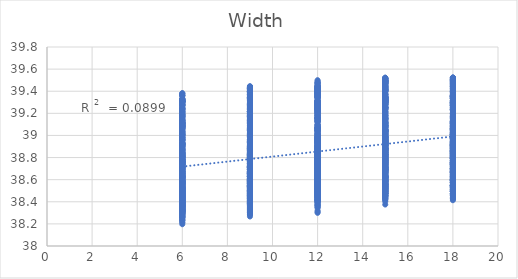
| Category | out:UTCI |
|---|---|
| 6.0 | 38.668 |
| 9.0 | 38.741 |
| 12.0 | 38.758 |
| 15.0 | 38.744 |
| 18.0 | 38.714 |
| 6.0 | 38.517 |
| 9.0 | 38.595 |
| 12.0 | 38.642 |
| 15.0 | 38.679 |
| 18.0 | 38.672 |
| 6.0 | 38.457 |
| 9.0 | 38.521 |
| 12.0 | 38.559 |
| 15.0 | 38.588 |
| 18.0 | 38.606 |
| 6.0 | 38.426 |
| 9.0 | 38.489 |
| 12.0 | 38.495 |
| 15.0 | 38.526 |
| 18.0 | 38.543 |
| 6.0 | 38.423 |
| 9.0 | 38.454 |
| 12.0 | 38.47 |
| 15.0 | 38.474 |
| 18.0 | 38.492 |
| 6.0 | 38.417 |
| 9.0 | 38.42 |
| 12.0 | 38.46 |
| 15.0 | 38.458 |
| 18.0 | 38.452 |
| 6.0 | 38.414 |
| 9.0 | 38.429 |
| 12.0 | 38.432 |
| 15.0 | 38.448 |
| 18.0 | 38.426 |
| 6.0 | 38.403 |
| 9.0 | 38.423 |
| 12.0 | 38.41 |
| 15.0 | 38.426 |
| 18.0 | 38.414 |
| 6.0 | 38.693 |
| 9.0 | 38.779 |
| 12.0 | 38.826 |
| 15.0 | 38.826 |
| 18.0 | 38.8 |
| 6.0 | 38.522 |
| 9.0 | 38.629 |
| 12.0 | 38.708 |
| 15.0 | 38.76 |
| 18.0 | 38.75 |
| 6.0 | 38.432 |
| 9.0 | 38.535 |
| 12.0 | 38.614 |
| 15.0 | 38.657 |
| 18.0 | 38.685 |
| 6.0 | 38.386 |
| 9.0 | 38.482 |
| 12.0 | 38.531 |
| 15.0 | 38.588 |
| 18.0 | 38.615 |
| 6.0 | 38.378 |
| 9.0 | 38.439 |
| 12.0 | 38.492 |
| 15.0 | 38.522 |
| 18.0 | 38.553 |
| 6.0 | 38.37 |
| 9.0 | 38.397 |
| 12.0 | 38.476 |
| 15.0 | 38.494 |
| 18.0 | 38.504 |
| 6.0 | 38.364 |
| 9.0 | 38.402 |
| 12.0 | 38.442 |
| 15.0 | 38.48 |
| 18.0 | 38.47 |
| 6.0 | 38.352 |
| 9.0 | 38.397 |
| 12.0 | 38.416 |
| 15.0 | 38.455 |
| 18.0 | 38.456 |
| 6.0 | 38.703 |
| 9.0 | 38.82 |
| 12.0 | 38.854 |
| 15.0 | 38.875 |
| 18.0 | 38.856 |
| 6.0 | 38.522 |
| 9.0 | 38.662 |
| 12.0 | 38.729 |
| 15.0 | 38.799 |
| 18.0 | 38.802 |
| 6.0 | 38.418 |
| 9.0 | 38.557 |
| 12.0 | 38.63 |
| 15.0 | 38.697 |
| 18.0 | 38.734 |
| 6.0 | 38.355 |
| 9.0 | 38.493 |
| 12.0 | 38.54 |
| 15.0 | 38.623 |
| 18.0 | 38.661 |
| 6.0 | 38.34 |
| 9.0 | 38.436 |
| 12.0 | 38.489 |
| 15.0 | 38.549 |
| 18.0 | 38.593 |
| 6.0 | 38.33 |
| 9.0 | 38.388 |
| 12.0 | 38.463 |
| 15.0 | 38.512 |
| 18.0 | 38.534 |
| 6.0 | 38.324 |
| 9.0 | 38.389 |
| 12.0 | 38.424 |
| 15.0 | 38.49 |
| 18.0 | 38.494 |
| 6.0 | 38.31 |
| 9.0 | 38.383 |
| 12.0 | 38.394 |
| 15.0 | 38.462 |
| 18.0 | 38.472 |
| 6.0 | 38.712 |
| 9.0 | 38.824 |
| 12.0 | 38.878 |
| 15.0 | 38.886 |
| 18.0 | 38.88 |
| 6.0 | 38.524 |
| 9.0 | 38.658 |
| 12.0 | 38.749 |
| 15.0 | 38.808 |
| 18.0 | 38.826 |
| 6.0 | 38.414 |
| 9.0 | 38.547 |
| 12.0 | 38.644 |
| 15.0 | 38.704 |
| 18.0 | 38.756 |
| 6.0 | 38.343 |
| 9.0 | 38.474 |
| 12.0 | 38.547 |
| 15.0 | 38.622 |
| 18.0 | 38.68 |
| 6.0 | 38.319 |
| 9.0 | 38.407 |
| 12.0 | 38.491 |
| 15.0 | 38.544 |
| 18.0 | 38.609 |
| 6.0 | 38.305 |
| 9.0 | 38.348 |
| 12.0 | 38.458 |
| 15.0 | 38.501 |
| 18.0 | 38.547 |
| 6.0 | 38.297 |
| 9.0 | 38.344 |
| 12.0 | 38.413 |
| 15.0 | 38.473 |
| 18.0 | 38.499 |
| 6.0 | 38.282 |
| 9.0 | 38.334 |
| 12.0 | 38.38 |
| 15.0 | 38.439 |
| 18.0 | 38.473 |
| 6.0 | 38.71 |
| 9.0 | 38.832 |
| 12.0 | 38.879 |
| 15.0 | 38.908 |
| 18.0 | 38.891 |
| 6.0 | 38.52 |
| 9.0 | 38.661 |
| 12.0 | 38.745 |
| 15.0 | 38.826 |
| 18.0 | 38.833 |
| 6.0 | 38.406 |
| 9.0 | 38.545 |
| 12.0 | 38.636 |
| 15.0 | 38.719 |
| 18.0 | 38.76 |
| 6.0 | 38.332 |
| 9.0 | 38.468 |
| 12.0 | 38.534 |
| 15.0 | 38.634 |
| 18.0 | 38.681 |
| 6.0 | 38.305 |
| 9.0 | 38.398 |
| 12.0 | 38.477 |
| 15.0 | 38.554 |
| 18.0 | 38.609 |
| 6.0 | 38.285 |
| 9.0 | 38.335 |
| 12.0 | 38.439 |
| 15.0 | 38.509 |
| 18.0 | 38.543 |
| 6.0 | 38.275 |
| 9.0 | 38.327 |
| 12.0 | 38.388 |
| 15.0 | 38.475 |
| 18.0 | 38.493 |
| 6.0 | 38.26 |
| 9.0 | 38.313 |
| 12.0 | 38.346 |
| 15.0 | 38.434 |
| 18.0 | 38.462 |
| 6.0 | 38.703 |
| 9.0 | 38.833 |
| 12.0 | 38.884 |
| 15.0 | 38.91 |
| 18.0 | 38.909 |
| 6.0 | 38.51 |
| 9.0 | 38.661 |
| 12.0 | 38.746 |
| 15.0 | 38.824 |
| 18.0 | 38.847 |
| 6.0 | 38.396 |
| 9.0 | 38.542 |
| 12.0 | 38.633 |
| 15.0 | 38.716 |
| 18.0 | 38.771 |
| 6.0 | 38.319 |
| 9.0 | 38.461 |
| 12.0 | 38.527 |
| 15.0 | 38.627 |
| 18.0 | 38.69 |
| 6.0 | 38.291 |
| 9.0 | 38.389 |
| 12.0 | 38.467 |
| 15.0 | 38.544 |
| 18.0 | 38.616 |
| 6.0 | 38.265 |
| 9.0 | 38.321 |
| 12.0 | 38.423 |
| 15.0 | 38.494 |
| 18.0 | 38.545 |
| 6.0 | 38.252 |
| 9.0 | 38.309 |
| 12.0 | 38.368 |
| 15.0 | 38.459 |
| 18.0 | 38.493 |
| 6.0 | 38.235 |
| 9.0 | 38.291 |
| 12.0 | 38.321 |
| 15.0 | 38.415 |
| 18.0 | 38.457 |
| 6.0 | 38.688 |
| 9.0 | 38.836 |
| 12.0 | 38.885 |
| 15.0 | 38.915 |
| 18.0 | 38.902 |
| 6.0 | 38.494 |
| 9.0 | 38.663 |
| 12.0 | 38.747 |
| 15.0 | 38.825 |
| 18.0 | 38.839 |
| 6.0 | 38.379 |
| 9.0 | 38.543 |
| 12.0 | 38.631 |
| 15.0 | 38.714 |
| 18.0 | 38.76 |
| 6.0 | 38.301 |
| 9.0 | 38.46 |
| 12.0 | 38.522 |
| 15.0 | 38.623 |
| 18.0 | 38.676 |
| 6.0 | 38.273 |
| 9.0 | 38.386 |
| 12.0 | 38.461 |
| 15.0 | 38.537 |
| 18.0 | 38.601 |
| 6.0 | 38.247 |
| 9.0 | 38.316 |
| 12.0 | 38.415 |
| 15.0 | 38.485 |
| 18.0 | 38.528 |
| 6.0 | 38.232 |
| 9.0 | 38.303 |
| 12.0 | 38.358 |
| 15.0 | 38.448 |
| 18.0 | 38.475 |
| 6.0 | 38.212 |
| 9.0 | 38.282 |
| 12.0 | 38.309 |
| 15.0 | 38.402 |
| 18.0 | 38.438 |
| 6.0 | 38.678 |
| 9.0 | 38.832 |
| 12.0 | 38.888 |
| 15.0 | 38.904 |
| 18.0 | 38.906 |
| 6.0 | 38.483 |
| 9.0 | 38.657 |
| 12.0 | 38.748 |
| 15.0 | 38.812 |
| 18.0 | 38.839 |
| 6.0 | 38.368 |
| 9.0 | 38.535 |
| 12.0 | 38.632 |
| 15.0 | 38.699 |
| 18.0 | 38.759 |
| 6.0 | 38.288 |
| 9.0 | 38.452 |
| 12.0 | 38.521 |
| 15.0 | 38.606 |
| 18.0 | 38.672 |
| 6.0 | 38.26 |
| 9.0 | 38.375 |
| 12.0 | 38.456 |
| 15.0 | 38.518 |
| 18.0 | 38.596 |
| 6.0 | 38.234 |
| 9.0 | 38.302 |
| 12.0 | 38.407 |
| 15.0 | 38.46 |
| 18.0 | 38.518 |
| 6.0 | 38.218 |
| 9.0 | 38.288 |
| 12.0 | 38.349 |
| 15.0 | 38.422 |
| 18.0 | 38.464 |
| 6.0 | 38.197 |
| 9.0 | 38.267 |
| 12.0 | 38.3 |
| 15.0 | 38.375 |
| 18.0 | 38.426 |
| 6.0 | 38.717 |
| 9.0 | 38.761 |
| 12.0 | 38.802 |
| 15.0 | 38.76 |
| 18.0 | 38.723 |
| 6.0 | 38.567 |
| 9.0 | 38.643 |
| 12.0 | 38.711 |
| 15.0 | 38.699 |
| 18.0 | 38.701 |
| 6.0 | 38.508 |
| 9.0 | 38.539 |
| 12.0 | 38.602 |
| 15.0 | 38.629 |
| 18.0 | 38.636 |
| 6.0 | 38.472 |
| 9.0 | 38.507 |
| 12.0 | 38.535 |
| 15.0 | 38.542 |
| 18.0 | 38.569 |
| 6.0 | 38.459 |
| 9.0 | 38.454 |
| 12.0 | 38.507 |
| 15.0 | 38.491 |
| 18.0 | 38.509 |
| 6.0 | 38.466 |
| 9.0 | 38.451 |
| 12.0 | 38.5 |
| 15.0 | 38.473 |
| 18.0 | 38.465 |
| 6.0 | 38.441 |
| 9.0 | 38.454 |
| 12.0 | 38.455 |
| 15.0 | 38.449 |
| 18.0 | 38.442 |
| 6.0 | 38.436 |
| 9.0 | 38.425 |
| 12.0 | 38.438 |
| 15.0 | 38.433 |
| 18.0 | 38.428 |
| 6.0 | 38.762 |
| 9.0 | 38.84 |
| 12.0 | 38.893 |
| 15.0 | 38.85 |
| 18.0 | 38.832 |
| 6.0 | 38.593 |
| 9.0 | 38.72 |
| 12.0 | 38.795 |
| 15.0 | 38.794 |
| 18.0 | 38.81 |
| 6.0 | 38.508 |
| 9.0 | 38.601 |
| 12.0 | 38.677 |
| 15.0 | 38.714 |
| 18.0 | 38.737 |
| 6.0 | 38.453 |
| 9.0 | 38.546 |
| 12.0 | 38.594 |
| 15.0 | 38.622 |
| 18.0 | 38.669 |
| 6.0 | 38.435 |
| 9.0 | 38.482 |
| 12.0 | 38.551 |
| 15.0 | 38.557 |
| 18.0 | 38.6 |
| 6.0 | 38.441 |
| 9.0 | 38.47 |
| 12.0 | 38.537 |
| 15.0 | 38.527 |
| 18.0 | 38.546 |
| 6.0 | 38.41 |
| 9.0 | 38.471 |
| 12.0 | 38.486 |
| 15.0 | 38.498 |
| 18.0 | 38.513 |
| 6.0 | 38.402 |
| 9.0 | 38.442 |
| 12.0 | 38.466 |
| 15.0 | 38.478 |
| 18.0 | 38.496 |
| 6.0 | 38.778 |
| 9.0 | 38.869 |
| 12.0 | 38.908 |
| 15.0 | 38.92 |
| 18.0 | 38.88 |
| 6.0 | 38.597 |
| 9.0 | 38.741 |
| 12.0 | 38.808 |
| 15.0 | 38.862 |
| 18.0 | 38.849 |
| 6.0 | 38.496 |
| 9.0 | 38.61 |
| 12.0 | 38.69 |
| 15.0 | 38.768 |
| 18.0 | 38.776 |
| 6.0 | 38.426 |
| 9.0 | 38.546 |
| 12.0 | 38.6 |
| 15.0 | 38.673 |
| 18.0 | 38.704 |
| 6.0 | 38.398 |
| 9.0 | 38.47 |
| 12.0 | 38.546 |
| 15.0 | 38.602 |
| 18.0 | 38.631 |
| 6.0 | 38.4 |
| 9.0 | 38.452 |
| 12.0 | 38.522 |
| 15.0 | 38.562 |
| 18.0 | 38.57 |
| 6.0 | 38.372 |
| 9.0 | 38.448 |
| 12.0 | 38.465 |
| 15.0 | 38.525 |
| 18.0 | 38.531 |
| 6.0 | 38.362 |
| 9.0 | 38.418 |
| 12.0 | 38.441 |
| 15.0 | 38.503 |
| 18.0 | 38.508 |
| 6.0 | 38.774 |
| 9.0 | 38.881 |
| 12.0 | 38.947 |
| 15.0 | 38.917 |
| 18.0 | 38.921 |
| 6.0 | 38.585 |
| 9.0 | 38.745 |
| 12.0 | 38.841 |
| 15.0 | 38.854 |
| 18.0 | 38.891 |
| 6.0 | 38.477 |
| 9.0 | 38.608 |
| 12.0 | 38.717 |
| 15.0 | 38.763 |
| 18.0 | 38.815 |
| 6.0 | 38.412 |
| 9.0 | 38.543 |
| 12.0 | 38.62 |
| 15.0 | 38.667 |
| 18.0 | 38.741 |
| 6.0 | 38.375 |
| 9.0 | 38.46 |
| 12.0 | 38.563 |
| 15.0 | 38.592 |
| 18.0 | 38.666 |
| 6.0 | 38.373 |
| 9.0 | 38.433 |
| 12.0 | 38.532 |
| 15.0 | 38.548 |
| 18.0 | 38.602 |
| 6.0 | 38.348 |
| 9.0 | 38.425 |
| 12.0 | 38.469 |
| 15.0 | 38.504 |
| 18.0 | 38.556 |
| 6.0 | 38.335 |
| 9.0 | 38.391 |
| 12.0 | 38.44 |
| 15.0 | 38.478 |
| 18.0 | 38.529 |
| 6.0 | 38.764 |
| 9.0 | 38.86 |
| 12.0 | 38.954 |
| 15.0 | 38.945 |
| 18.0 | 38.925 |
| 6.0 | 38.572 |
| 9.0 | 38.722 |
| 12.0 | 38.844 |
| 15.0 | 38.878 |
| 18.0 | 38.892 |
| 6.0 | 38.461 |
| 9.0 | 38.579 |
| 12.0 | 38.716 |
| 15.0 | 38.783 |
| 18.0 | 38.812 |
| 6.0 | 38.393 |
| 9.0 | 38.509 |
| 12.0 | 38.615 |
| 15.0 | 38.684 |
| 18.0 | 38.737 |
| 6.0 | 38.358 |
| 9.0 | 38.433 |
| 12.0 | 38.555 |
| 15.0 | 38.607 |
| 18.0 | 38.661 |
| 6.0 | 38.349 |
| 9.0 | 38.4 |
| 12.0 | 38.519 |
| 15.0 | 38.561 |
| 18.0 | 38.595 |
| 6.0 | 38.324 |
| 9.0 | 38.389 |
| 12.0 | 38.453 |
| 15.0 | 38.514 |
| 18.0 | 38.546 |
| 6.0 | 38.31 |
| 9.0 | 38.352 |
| 12.0 | 38.416 |
| 15.0 | 38.48 |
| 18.0 | 38.515 |
| 6.0 | 38.776 |
| 9.0 | 38.889 |
| 12.0 | 38.964 |
| 15.0 | 38.959 |
| 18.0 | 38.943 |
| 6.0 | 38.584 |
| 9.0 | 38.746 |
| 12.0 | 38.852 |
| 15.0 | 38.889 |
| 18.0 | 38.906 |
| 6.0 | 38.47 |
| 9.0 | 38.601 |
| 12.0 | 38.719 |
| 15.0 | 38.792 |
| 18.0 | 38.823 |
| 6.0 | 38.4 |
| 9.0 | 38.526 |
| 12.0 | 38.614 |
| 15.0 | 38.69 |
| 18.0 | 38.746 |
| 6.0 | 38.362 |
| 9.0 | 38.445 |
| 12.0 | 38.552 |
| 15.0 | 38.61 |
| 18.0 | 38.668 |
| 6.0 | 38.339 |
| 9.0 | 38.392 |
| 12.0 | 38.506 |
| 15.0 | 38.559 |
| 18.0 | 38.593 |
| 6.0 | 38.31 |
| 9.0 | 38.378 |
| 12.0 | 38.435 |
| 15.0 | 38.51 |
| 18.0 | 38.543 |
| 6.0 | 38.294 |
| 9.0 | 38.339 |
| 12.0 | 38.394 |
| 15.0 | 38.473 |
| 18.0 | 38.507 |
| 6.0 | 38.763 |
| 9.0 | 38.894 |
| 12.0 | 38.944 |
| 15.0 | 38.952 |
| 18.0 | 38.955 |
| 6.0 | 38.566 |
| 9.0 | 38.75 |
| 12.0 | 38.829 |
| 15.0 | 38.879 |
| 18.0 | 38.918 |
| 6.0 | 38.451 |
| 9.0 | 38.603 |
| 12.0 | 38.695 |
| 15.0 | 38.778 |
| 18.0 | 38.832 |
| 6.0 | 38.379 |
| 9.0 | 38.526 |
| 12.0 | 38.588 |
| 15.0 | 38.674 |
| 18.0 | 38.752 |
| 6.0 | 38.339 |
| 9.0 | 38.442 |
| 12.0 | 38.525 |
| 15.0 | 38.591 |
| 18.0 | 38.672 |
| 6.0 | 38.314 |
| 9.0 | 38.388 |
| 12.0 | 38.476 |
| 15.0 | 38.538 |
| 18.0 | 38.596 |
| 6.0 | 38.292 |
| 9.0 | 38.373 |
| 12.0 | 38.415 |
| 15.0 | 38.491 |
| 18.0 | 38.548 |
| 6.0 | 38.274 |
| 9.0 | 38.334 |
| 12.0 | 38.371 |
| 15.0 | 38.454 |
| 18.0 | 38.51 |
| 6.0 | 38.741 |
| 9.0 | 38.87 |
| 12.0 | 38.954 |
| 15.0 | 38.95 |
| 18.0 | 38.959 |
| 6.0 | 38.541 |
| 9.0 | 38.726 |
| 12.0 | 38.839 |
| 15.0 | 38.874 |
| 18.0 | 38.92 |
| 6.0 | 38.429 |
| 9.0 | 38.579 |
| 12.0 | 38.703 |
| 15.0 | 38.773 |
| 18.0 | 38.834 |
| 6.0 | 38.358 |
| 9.0 | 38.501 |
| 12.0 | 38.595 |
| 15.0 | 38.667 |
| 18.0 | 38.751 |
| 6.0 | 38.318 |
| 9.0 | 38.415 |
| 12.0 | 38.528 |
| 15.0 | 38.583 |
| 18.0 | 38.669 |
| 6.0 | 38.293 |
| 9.0 | 38.359 |
| 12.0 | 38.477 |
| 15.0 | 38.525 |
| 18.0 | 38.588 |
| 6.0 | 38.269 |
| 9.0 | 38.344 |
| 12.0 | 38.413 |
| 15.0 | 38.476 |
| 18.0 | 38.539 |
| 6.0 | 38.259 |
| 9.0 | 38.316 |
| 12.0 | 38.368 |
| 15.0 | 38.435 |
| 18.0 | 38.496 |
| 6.0 | 38.79 |
| 9.0 | 38.817 |
| 12.0 | 38.802 |
| 15.0 | 38.809 |
| 18.0 | 38.819 |
| 6.0 | 38.619 |
| 9.0 | 38.723 |
| 12.0 | 38.74 |
| 15.0 | 38.769 |
| 18.0 | 38.764 |
| 6.0 | 38.538 |
| 9.0 | 38.586 |
| 12.0 | 38.651 |
| 15.0 | 38.706 |
| 18.0 | 38.716 |
| 6.0 | 38.503 |
| 9.0 | 38.541 |
| 12.0 | 38.563 |
| 15.0 | 38.624 |
| 18.0 | 38.652 |
| 6.0 | 38.477 |
| 9.0 | 38.501 |
| 12.0 | 38.516 |
| 15.0 | 38.562 |
| 18.0 | 38.586 |
| 6.0 | 38.472 |
| 9.0 | 38.47 |
| 12.0 | 38.49 |
| 15.0 | 38.512 |
| 18.0 | 38.535 |
| 6.0 | 38.455 |
| 9.0 | 38.465 |
| 12.0 | 38.457 |
| 15.0 | 38.503 |
| 18.0 | 38.493 |
| 6.0 | 38.445 |
| 9.0 | 38.453 |
| 12.0 | 38.441 |
| 15.0 | 38.476 |
| 18.0 | 38.472 |
| 6.0 | 38.822 |
| 9.0 | 38.918 |
| 12.0 | 38.896 |
| 15.0 | 38.908 |
| 18.0 | 38.923 |
| 6.0 | 38.633 |
| 9.0 | 38.801 |
| 12.0 | 38.832 |
| 15.0 | 38.855 |
| 18.0 | 38.874 |
| 6.0 | 38.533 |
| 9.0 | 38.666 |
| 12.0 | 38.731 |
| 15.0 | 38.786 |
| 18.0 | 38.823 |
| 6.0 | 38.48 |
| 9.0 | 38.605 |
| 12.0 | 38.638 |
| 15.0 | 38.704 |
| 18.0 | 38.756 |
| 6.0 | 38.446 |
| 9.0 | 38.551 |
| 12.0 | 38.578 |
| 15.0 | 38.632 |
| 18.0 | 38.681 |
| 6.0 | 38.44 |
| 9.0 | 38.514 |
| 12.0 | 38.543 |
| 15.0 | 38.574 |
| 18.0 | 38.625 |
| 6.0 | 38.42 |
| 9.0 | 38.507 |
| 12.0 | 38.507 |
| 15.0 | 38.557 |
| 18.0 | 38.577 |
| 6.0 | 38.411 |
| 9.0 | 38.493 |
| 12.0 | 38.486 |
| 15.0 | 38.527 |
| 18.0 | 38.549 |
| 6.0 | 38.832 |
| 9.0 | 38.925 |
| 12.0 | 38.944 |
| 15.0 | 38.969 |
| 18.0 | 38.98 |
| 6.0 | 38.632 |
| 9.0 | 38.813 |
| 12.0 | 38.868 |
| 15.0 | 38.91 |
| 18.0 | 38.928 |
| 6.0 | 38.52 |
| 9.0 | 38.667 |
| 12.0 | 38.765 |
| 15.0 | 38.841 |
| 18.0 | 38.865 |
| 6.0 | 38.457 |
| 9.0 | 38.599 |
| 12.0 | 38.667 |
| 15.0 | 38.756 |
| 18.0 | 38.796 |
| 6.0 | 38.418 |
| 9.0 | 38.535 |
| 12.0 | 38.6 |
| 15.0 | 38.68 |
| 18.0 | 38.722 |
| 6.0 | 38.405 |
| 9.0 | 38.488 |
| 12.0 | 38.555 |
| 15.0 | 38.614 |
| 18.0 | 38.662 |
| 6.0 | 38.384 |
| 9.0 | 38.477 |
| 12.0 | 38.514 |
| 15.0 | 38.591 |
| 18.0 | 38.607 |
| 6.0 | 38.374 |
| 9.0 | 38.461 |
| 12.0 | 38.489 |
| 15.0 | 38.555 |
| 18.0 | 38.574 |
| 6.0 | 38.833 |
| 9.0 | 38.943 |
| 12.0 | 38.957 |
| 15.0 | 38.99 |
| 18.0 | 39.021 |
| 6.0 | 38.626 |
| 9.0 | 38.826 |
| 12.0 | 38.88 |
| 15.0 | 38.932 |
| 18.0 | 38.966 |
| 6.0 | 38.509 |
| 9.0 | 38.674 |
| 12.0 | 38.772 |
| 15.0 | 38.86 |
| 18.0 | 38.9 |
| 6.0 | 38.443 |
| 9.0 | 38.593 |
| 12.0 | 38.666 |
| 15.0 | 38.77 |
| 18.0 | 38.829 |
| 6.0 | 38.399 |
| 9.0 | 38.525 |
| 12.0 | 38.596 |
| 15.0 | 38.692 |
| 18.0 | 38.753 |
| 6.0 | 38.381 |
| 9.0 | 38.471 |
| 12.0 | 38.546 |
| 15.0 | 38.623 |
| 18.0 | 38.691 |
| 6.0 | 38.359 |
| 9.0 | 38.455 |
| 12.0 | 38.5 |
| 15.0 | 38.595 |
| 18.0 | 38.634 |
| 6.0 | 38.347 |
| 9.0 | 38.435 |
| 12.0 | 38.466 |
| 15.0 | 38.552 |
| 18.0 | 38.596 |
| 6.0 | 38.83 |
| 9.0 | 38.943 |
| 12.0 | 38.97 |
| 15.0 | 39 |
| 18.0 | 39.032 |
| 6.0 | 38.622 |
| 9.0 | 38.822 |
| 12.0 | 38.889 |
| 15.0 | 38.938 |
| 18.0 | 38.971 |
| 6.0 | 38.5 |
| 9.0 | 38.666 |
| 12.0 | 38.777 |
| 15.0 | 38.864 |
| 18.0 | 38.907 |
| 6.0 | 38.43 |
| 9.0 | 38.581 |
| 12.0 | 38.668 |
| 15.0 | 38.771 |
| 18.0 | 38.834 |
| 6.0 | 38.386 |
| 9.0 | 38.507 |
| 12.0 | 38.596 |
| 15.0 | 38.69 |
| 18.0 | 38.761 |
| 6.0 | 38.364 |
| 9.0 | 38.45 |
| 12.0 | 38.544 |
| 15.0 | 38.619 |
| 18.0 | 38.696 |
| 6.0 | 38.343 |
| 9.0 | 38.43 |
| 12.0 | 38.496 |
| 15.0 | 38.588 |
| 18.0 | 38.637 |
| 6.0 | 38.329 |
| 9.0 | 38.406 |
| 12.0 | 38.457 |
| 15.0 | 38.541 |
| 18.0 | 38.595 |
| 6.0 | 38.839 |
| 9.0 | 38.94 |
| 12.0 | 38.98 |
| 15.0 | 39.012 |
| 18.0 | 39.033 |
| 6.0 | 38.628 |
| 9.0 | 38.815 |
| 12.0 | 38.899 |
| 15.0 | 38.947 |
| 18.0 | 38.974 |
| 6.0 | 38.505 |
| 9.0 | 38.654 |
| 12.0 | 38.782 |
| 15.0 | 38.869 |
| 18.0 | 38.907 |
| 6.0 | 38.435 |
| 9.0 | 38.566 |
| 12.0 | 38.668 |
| 15.0 | 38.774 |
| 18.0 | 38.832 |
| 6.0 | 38.389 |
| 9.0 | 38.49 |
| 12.0 | 38.594 |
| 15.0 | 38.691 |
| 18.0 | 38.757 |
| 6.0 | 38.361 |
| 9.0 | 38.434 |
| 12.0 | 38.543 |
| 15.0 | 38.615 |
| 18.0 | 38.687 |
| 6.0 | 38.336 |
| 9.0 | 38.413 |
| 12.0 | 38.494 |
| 15.0 | 38.582 |
| 18.0 | 38.626 |
| 6.0 | 38.322 |
| 9.0 | 38.386 |
| 12.0 | 38.452 |
| 15.0 | 38.533 |
| 18.0 | 38.583 |
| 6.0 | 38.833 |
| 9.0 | 38.948 |
| 12.0 | 38.979 |
| 15.0 | 39.032 |
| 18.0 | 39.057 |
| 6.0 | 38.621 |
| 9.0 | 38.822 |
| 12.0 | 38.895 |
| 15.0 | 38.966 |
| 18.0 | 38.994 |
| 6.0 | 38.496 |
| 9.0 | 38.66 |
| 12.0 | 38.777 |
| 15.0 | 38.884 |
| 18.0 | 38.926 |
| 6.0 | 38.425 |
| 9.0 | 38.57 |
| 12.0 | 38.662 |
| 15.0 | 38.787 |
| 18.0 | 38.849 |
| 6.0 | 38.379 |
| 9.0 | 38.492 |
| 12.0 | 38.586 |
| 15.0 | 38.701 |
| 18.0 | 38.771 |
| 6.0 | 38.351 |
| 9.0 | 38.434 |
| 12.0 | 38.532 |
| 15.0 | 38.623 |
| 18.0 | 38.7 |
| 6.0 | 38.326 |
| 9.0 | 38.412 |
| 12.0 | 38.482 |
| 15.0 | 38.589 |
| 18.0 | 38.635 |
| 6.0 | 38.311 |
| 9.0 | 38.384 |
| 12.0 | 38.439 |
| 15.0 | 38.54 |
| 18.0 | 38.59 |
| 6.0 | 38.837 |
| 9.0 | 38.948 |
| 12.0 | 38.981 |
| 15.0 | 39.031 |
| 18.0 | 39.053 |
| 6.0 | 38.628 |
| 9.0 | 38.822 |
| 12.0 | 38.897 |
| 15.0 | 38.963 |
| 18.0 | 38.99 |
| 6.0 | 38.499 |
| 9.0 | 38.659 |
| 12.0 | 38.776 |
| 15.0 | 38.88 |
| 18.0 | 38.92 |
| 6.0 | 38.426 |
| 9.0 | 38.566 |
| 12.0 | 38.658 |
| 15.0 | 38.781 |
| 18.0 | 38.843 |
| 6.0 | 38.38 |
| 9.0 | 38.486 |
| 12.0 | 38.578 |
| 15.0 | 38.69 |
| 18.0 | 38.76 |
| 6.0 | 38.351 |
| 9.0 | 38.427 |
| 12.0 | 38.523 |
| 15.0 | 38.61 |
| 18.0 | 38.688 |
| 6.0 | 38.325 |
| 9.0 | 38.404 |
| 12.0 | 38.471 |
| 15.0 | 38.576 |
| 18.0 | 38.622 |
| 6.0 | 38.305 |
| 9.0 | 38.369 |
| 12.0 | 38.417 |
| 15.0 | 38.526 |
| 18.0 | 38.58 |
| 6.0 | 38.891 |
| 9.0 | 38.894 |
| 12.0 | 38.962 |
| 15.0 | 38.928 |
| 18.0 | 38.893 |
| 6.0 | 38.713 |
| 9.0 | 38.833 |
| 12.0 | 38.901 |
| 15.0 | 38.871 |
| 18.0 | 38.873 |
| 6.0 | 38.625 |
| 9.0 | 38.708 |
| 12.0 | 38.813 |
| 15.0 | 38.824 |
| 18.0 | 38.81 |
| 6.0 | 38.565 |
| 9.0 | 38.628 |
| 12.0 | 38.734 |
| 15.0 | 38.752 |
| 18.0 | 38.771 |
| 6.0 | 38.521 |
| 9.0 | 38.578 |
| 12.0 | 38.653 |
| 15.0 | 38.689 |
| 18.0 | 38.724 |
| 6.0 | 38.518 |
| 9.0 | 38.534 |
| 12.0 | 38.615 |
| 15.0 | 38.633 |
| 18.0 | 38.649 |
| 6.0 | 38.51 |
| 9.0 | 38.523 |
| 12.0 | 38.578 |
| 15.0 | 38.575 |
| 18.0 | 38.601 |
| 6.0 | 38.479 |
| 9.0 | 38.5 |
| 12.0 | 38.528 |
| 15.0 | 38.567 |
| 18.0 | 38.561 |
| 6.0 | 38.921 |
| 9.0 | 39.003 |
| 12.0 | 39.055 |
| 15.0 | 39.036 |
| 18.0 | 39.028 |
| 6.0 | 38.734 |
| 9.0 | 38.923 |
| 12.0 | 38.988 |
| 15.0 | 38.979 |
| 18.0 | 38.99 |
| 6.0 | 38.634 |
| 9.0 | 38.791 |
| 12.0 | 38.892 |
| 15.0 | 38.931 |
| 18.0 | 38.925 |
| 6.0 | 38.556 |
| 9.0 | 38.706 |
| 12.0 | 38.81 |
| 15.0 | 38.856 |
| 18.0 | 38.884 |
| 6.0 | 38.507 |
| 9.0 | 38.644 |
| 12.0 | 38.725 |
| 15.0 | 38.788 |
| 18.0 | 38.832 |
| 6.0 | 38.5 |
| 9.0 | 38.593 |
| 12.0 | 38.68 |
| 15.0 | 38.726 |
| 18.0 | 38.757 |
| 6.0 | 38.487 |
| 9.0 | 38.577 |
| 12.0 | 38.635 |
| 15.0 | 38.662 |
| 18.0 | 38.704 |
| 6.0 | 38.453 |
| 9.0 | 38.553 |
| 12.0 | 38.584 |
| 15.0 | 38.647 |
| 18.0 | 38.659 |
| 6.0 | 38.963 |
| 9.0 | 39.019 |
| 12.0 | 39.096 |
| 15.0 | 39.098 |
| 18.0 | 39.072 |
| 6.0 | 38.767 |
| 9.0 | 38.932 |
| 12.0 | 39.019 |
| 15.0 | 39.036 |
| 18.0 | 39.031 |
| 6.0 | 38.655 |
| 9.0 | 38.798 |
| 12.0 | 38.922 |
| 15.0 | 38.989 |
| 18.0 | 38.978 |
| 6.0 | 38.563 |
| 9.0 | 38.708 |
| 12.0 | 38.836 |
| 15.0 | 38.909 |
| 18.0 | 38.934 |
| 6.0 | 38.51 |
| 9.0 | 38.641 |
| 12.0 | 38.748 |
| 15.0 | 38.836 |
| 18.0 | 38.882 |
| 6.0 | 38.499 |
| 9.0 | 38.58 |
| 12.0 | 38.699 |
| 15.0 | 38.775 |
| 18.0 | 38.807 |
| 6.0 | 38.478 |
| 9.0 | 38.561 |
| 12.0 | 38.647 |
| 15.0 | 38.708 |
| 18.0 | 38.752 |
| 6.0 | 38.447 |
| 9.0 | 38.535 |
| 12.0 | 38.593 |
| 15.0 | 38.687 |
| 18.0 | 38.702 |
| 6.0 | 38.962 |
| 9.0 | 39.047 |
| 12.0 | 39.13 |
| 15.0 | 39.127 |
| 18.0 | 39.121 |
| 6.0 | 38.76 |
| 9.0 | 38.959 |
| 12.0 | 39.049 |
| 15.0 | 39.061 |
| 18.0 | 39.077 |
| 6.0 | 38.643 |
| 9.0 | 38.821 |
| 12.0 | 38.947 |
| 15.0 | 39.011 |
| 18.0 | 39.022 |
| 6.0 | 38.542 |
| 9.0 | 38.722 |
| 12.0 | 38.857 |
| 15.0 | 38.92 |
| 18.0 | 38.976 |
| 6.0 | 38.491 |
| 9.0 | 38.653 |
| 12.0 | 38.767 |
| 15.0 | 38.848 |
| 18.0 | 38.92 |
| 6.0 | 38.473 |
| 9.0 | 38.587 |
| 12.0 | 38.716 |
| 15.0 | 38.786 |
| 18.0 | 38.845 |
| 6.0 | 38.448 |
| 9.0 | 38.562 |
| 12.0 | 38.66 |
| 15.0 | 38.717 |
| 18.0 | 38.79 |
| 6.0 | 38.42 |
| 9.0 | 38.533 |
| 12.0 | 38.603 |
| 15.0 | 38.693 |
| 18.0 | 38.736 |
| 6.0 | 38.937 |
| 9.0 | 39.056 |
| 12.0 | 39.126 |
| 15.0 | 39.156 |
| 18.0 | 39.153 |
| 6.0 | 38.733 |
| 9.0 | 38.964 |
| 12.0 | 39.047 |
| 15.0 | 39.086 |
| 18.0 | 39.107 |
| 6.0 | 38.613 |
| 9.0 | 38.822 |
| 12.0 | 38.941 |
| 15.0 | 39.034 |
| 18.0 | 39.05 |
| 6.0 | 38.509 |
| 9.0 | 38.721 |
| 12.0 | 38.848 |
| 15.0 | 38.94 |
| 18.0 | 39.003 |
| 6.0 | 38.465 |
| 9.0 | 38.644 |
| 12.0 | 38.755 |
| 15.0 | 38.867 |
| 18.0 | 38.934 |
| 6.0 | 38.443 |
| 9.0 | 38.573 |
| 12.0 | 38.705 |
| 15.0 | 38.802 |
| 18.0 | 38.858 |
| 6.0 | 38.418 |
| 9.0 | 38.548 |
| 12.0 | 38.645 |
| 15.0 | 38.733 |
| 18.0 | 38.802 |
| 6.0 | 38.388 |
| 9.0 | 38.517 |
| 12.0 | 38.59 |
| 15.0 | 38.706 |
| 18.0 | 38.747 |
| 6.0 | 38.958 |
| 9.0 | 39.056 |
| 12.0 | 39.155 |
| 15.0 | 39.159 |
| 18.0 | 39.169 |
| 6.0 | 38.756 |
| 9.0 | 38.963 |
| 12.0 | 39.072 |
| 15.0 | 39.088 |
| 18.0 | 39.121 |
| 6.0 | 38.634 |
| 9.0 | 38.818 |
| 12.0 | 38.964 |
| 15.0 | 39.032 |
| 18.0 | 39.061 |
| 6.0 | 38.527 |
| 9.0 | 38.715 |
| 12.0 | 38.87 |
| 15.0 | 38.941 |
| 18.0 | 39.011 |
| 6.0 | 38.478 |
| 9.0 | 38.635 |
| 12.0 | 38.776 |
| 15.0 | 38.865 |
| 18.0 | 38.939 |
| 6.0 | 38.444 |
| 9.0 | 38.567 |
| 12.0 | 38.716 |
| 15.0 | 38.795 |
| 18.0 | 38.865 |
| 6.0 | 38.415 |
| 9.0 | 38.536 |
| 12.0 | 38.655 |
| 15.0 | 38.725 |
| 18.0 | 38.808 |
| 6.0 | 38.384 |
| 9.0 | 38.503 |
| 12.0 | 38.597 |
| 15.0 | 38.697 |
| 18.0 | 38.751 |
| 6.0 | 38.959 |
| 9.0 | 39.064 |
| 12.0 | 39.152 |
| 15.0 | 39.167 |
| 18.0 | 39.169 |
| 6.0 | 38.752 |
| 9.0 | 38.969 |
| 12.0 | 39.068 |
| 15.0 | 39.095 |
| 18.0 | 39.12 |
| 6.0 | 38.63 |
| 9.0 | 38.822 |
| 12.0 | 38.958 |
| 15.0 | 39.038 |
| 18.0 | 39.058 |
| 6.0 | 38.525 |
| 9.0 | 38.717 |
| 12.0 | 38.861 |
| 15.0 | 38.945 |
| 18.0 | 39.007 |
| 6.0 | 38.475 |
| 9.0 | 38.635 |
| 12.0 | 38.765 |
| 15.0 | 38.869 |
| 18.0 | 38.935 |
| 6.0 | 38.444 |
| 9.0 | 38.564 |
| 12.0 | 38.703 |
| 15.0 | 38.798 |
| 18.0 | 38.86 |
| 6.0 | 38.412 |
| 9.0 | 38.528 |
| 12.0 | 38.644 |
| 15.0 | 38.724 |
| 18.0 | 38.808 |
| 6.0 | 38.38 |
| 9.0 | 38.493 |
| 12.0 | 38.586 |
| 15.0 | 38.694 |
| 18.0 | 38.75 |
| 6.0 | 38.956 |
| 9.0 | 39.045 |
| 12.0 | 39.142 |
| 15.0 | 39.182 |
| 18.0 | 39.176 |
| 6.0 | 38.748 |
| 9.0 | 38.948 |
| 12.0 | 39.055 |
| 15.0 | 39.11 |
| 18.0 | 39.125 |
| 6.0 | 38.627 |
| 9.0 | 38.8 |
| 12.0 | 38.945 |
| 15.0 | 39.052 |
| 18.0 | 39.062 |
| 6.0 | 38.521 |
| 9.0 | 38.694 |
| 12.0 | 38.85 |
| 15.0 | 38.959 |
| 18.0 | 39.009 |
| 6.0 | 38.473 |
| 9.0 | 38.61 |
| 12.0 | 38.753 |
| 15.0 | 38.882 |
| 18.0 | 38.934 |
| 6.0 | 38.439 |
| 9.0 | 38.539 |
| 12.0 | 38.692 |
| 15.0 | 38.809 |
| 18.0 | 38.858 |
| 6.0 | 38.408 |
| 9.0 | 38.501 |
| 12.0 | 38.63 |
| 15.0 | 38.735 |
| 18.0 | 38.803 |
| 6.0 | 38.386 |
| 9.0 | 38.467 |
| 12.0 | 38.582 |
| 15.0 | 38.696 |
| 18.0 | 38.739 |
| 6.0 | 39.05 |
| 9.0 | 39.087 |
| 12.0 | 39.101 |
| 15.0 | 39.045 |
| 18.0 | 38.994 |
| 6.0 | 38.886 |
| 9.0 | 39.009 |
| 12.0 | 39.091 |
| 15.0 | 39.048 |
| 18.0 | 39.019 |
| 6.0 | 38.744 |
| 9.0 | 38.904 |
| 12.0 | 39.009 |
| 15.0 | 39.019 |
| 18.0 | 39.022 |
| 6.0 | 38.655 |
| 9.0 | 38.789 |
| 12.0 | 38.932 |
| 15.0 | 38.976 |
| 18.0 | 38.992 |
| 6.0 | 38.596 |
| 9.0 | 38.71 |
| 12.0 | 38.851 |
| 15.0 | 38.918 |
| 18.0 | 38.94 |
| 6.0 | 38.57 |
| 9.0 | 38.645 |
| 12.0 | 38.764 |
| 15.0 | 38.853 |
| 18.0 | 38.884 |
| 6.0 | 38.551 |
| 9.0 | 38.584 |
| 12.0 | 38.711 |
| 15.0 | 38.788 |
| 18.0 | 38.841 |
| 6.0 | 38.527 |
| 9.0 | 38.563 |
| 12.0 | 38.664 |
| 15.0 | 38.724 |
| 18.0 | 38.796 |
| 6.0 | 39.098 |
| 9.0 | 39.161 |
| 12.0 | 39.193 |
| 15.0 | 39.147 |
| 18.0 | 39.104 |
| 6.0 | 38.923 |
| 9.0 | 39.074 |
| 12.0 | 39.177 |
| 15.0 | 39.153 |
| 18.0 | 39.127 |
| 6.0 | 38.775 |
| 9.0 | 38.96 |
| 12.0 | 39.092 |
| 15.0 | 39.12 |
| 18.0 | 39.126 |
| 6.0 | 38.677 |
| 9.0 | 38.843 |
| 12.0 | 39.009 |
| 15.0 | 39.074 |
| 18.0 | 39.095 |
| 6.0 | 38.612 |
| 9.0 | 38.764 |
| 12.0 | 38.93 |
| 15.0 | 39.014 |
| 18.0 | 39.042 |
| 6.0 | 38.579 |
| 9.0 | 38.69 |
| 12.0 | 38.842 |
| 15.0 | 38.948 |
| 18.0 | 38.985 |
| 6.0 | 38.561 |
| 9.0 | 38.628 |
| 12.0 | 38.785 |
| 15.0 | 38.883 |
| 18.0 | 38.941 |
| 6.0 | 38.534 |
| 9.0 | 38.603 |
| 12.0 | 38.735 |
| 15.0 | 38.817 |
| 18.0 | 38.896 |
| 6.0 | 39.095 |
| 9.0 | 39.215 |
| 12.0 | 39.242 |
| 15.0 | 39.21 |
| 18.0 | 39.181 |
| 6.0 | 38.916 |
| 9.0 | 39.122 |
| 12.0 | 39.221 |
| 15.0 | 39.212 |
| 18.0 | 39.202 |
| 6.0 | 38.761 |
| 9.0 | 39.002 |
| 12.0 | 39.131 |
| 15.0 | 39.176 |
| 18.0 | 39.198 |
| 6.0 | 38.658 |
| 9.0 | 38.881 |
| 12.0 | 39.049 |
| 15.0 | 39.128 |
| 18.0 | 39.165 |
| 6.0 | 38.589 |
| 9.0 | 38.8 |
| 12.0 | 38.967 |
| 15.0 | 39.066 |
| 18.0 | 39.111 |
| 6.0 | 38.553 |
| 9.0 | 38.725 |
| 12.0 | 38.881 |
| 15.0 | 39 |
| 18.0 | 39.053 |
| 6.0 | 38.53 |
| 9.0 | 38.66 |
| 12.0 | 38.821 |
| 15.0 | 38.934 |
| 18.0 | 39.008 |
| 6.0 | 38.502 |
| 9.0 | 38.629 |
| 12.0 | 38.767 |
| 15.0 | 38.865 |
| 18.0 | 38.963 |
| 6.0 | 39.108 |
| 9.0 | 39.216 |
| 12.0 | 39.274 |
| 15.0 | 39.253 |
| 18.0 | 39.23 |
| 6.0 | 38.921 |
| 9.0 | 39.114 |
| 12.0 | 39.249 |
| 15.0 | 39.254 |
| 18.0 | 39.25 |
| 6.0 | 38.761 |
| 9.0 | 38.995 |
| 12.0 | 39.157 |
| 15.0 | 39.218 |
| 18.0 | 39.243 |
| 6.0 | 38.654 |
| 9.0 | 38.884 |
| 12.0 | 39.071 |
| 15.0 | 39.156 |
| 18.0 | 39.208 |
| 6.0 | 38.58 |
| 9.0 | 38.8 |
| 12.0 | 38.987 |
| 15.0 | 39.093 |
| 18.0 | 39.152 |
| 6.0 | 38.543 |
| 9.0 | 38.723 |
| 12.0 | 38.897 |
| 15.0 | 39.021 |
| 18.0 | 39.094 |
| 6.0 | 38.516 |
| 9.0 | 38.658 |
| 12.0 | 38.838 |
| 15.0 | 38.954 |
| 18.0 | 39.047 |
| 6.0 | 38.485 |
| 9.0 | 38.624 |
| 12.0 | 38.784 |
| 15.0 | 38.888 |
| 18.0 | 39.001 |
| 6.0 | 39.113 |
| 9.0 | 39.23 |
| 12.0 | 39.283 |
| 15.0 | 39.282 |
| 18.0 | 39.255 |
| 6.0 | 38.925 |
| 9.0 | 39.126 |
| 12.0 | 39.255 |
| 15.0 | 39.281 |
| 18.0 | 39.272 |
| 6.0 | 38.761 |
| 9.0 | 39.004 |
| 12.0 | 39.16 |
| 15.0 | 39.243 |
| 18.0 | 39.263 |
| 6.0 | 38.65 |
| 9.0 | 38.889 |
| 12.0 | 39.072 |
| 15.0 | 39.175 |
| 18.0 | 39.225 |
| 6.0 | 38.569 |
| 9.0 | 38.788 |
| 12.0 | 38.986 |
| 15.0 | 39.109 |
| 18.0 | 39.171 |
| 6.0 | 38.532 |
| 9.0 | 38.709 |
| 12.0 | 38.895 |
| 15.0 | 39.04 |
| 18.0 | 39.111 |
| 6.0 | 38.504 |
| 9.0 | 38.644 |
| 12.0 | 38.836 |
| 15.0 | 38.973 |
| 18.0 | 39.063 |
| 6.0 | 38.471 |
| 9.0 | 38.608 |
| 12.0 | 38.78 |
| 15.0 | 38.906 |
| 18.0 | 39.017 |
| 6.0 | 39.111 |
| 9.0 | 39.228 |
| 12.0 | 39.291 |
| 15.0 | 39.293 |
| 18.0 | 39.273 |
| 6.0 | 38.923 |
| 9.0 | 39.127 |
| 12.0 | 39.253 |
| 15.0 | 39.291 |
| 18.0 | 39.286 |
| 6.0 | 38.756 |
| 9.0 | 39 |
| 12.0 | 39.158 |
| 15.0 | 39.25 |
| 18.0 | 39.274 |
| 6.0 | 38.641 |
| 9.0 | 38.882 |
| 12.0 | 39.067 |
| 15.0 | 39.181 |
| 18.0 | 39.234 |
| 6.0 | 38.559 |
| 9.0 | 38.779 |
| 12.0 | 38.979 |
| 15.0 | 39.114 |
| 18.0 | 39.178 |
| 6.0 | 38.521 |
| 9.0 | 38.698 |
| 12.0 | 38.902 |
| 15.0 | 39.043 |
| 18.0 | 39.125 |
| 6.0 | 38.493 |
| 9.0 | 38.631 |
| 12.0 | 38.839 |
| 15.0 | 38.975 |
| 18.0 | 39.075 |
| 6.0 | 38.459 |
| 9.0 | 38.593 |
| 12.0 | 38.782 |
| 15.0 | 38.907 |
| 18.0 | 39.028 |
| 6.0 | 39.105 |
| 9.0 | 39.217 |
| 12.0 | 39.289 |
| 15.0 | 39.304 |
| 18.0 | 39.282 |
| 6.0 | 38.916 |
| 9.0 | 39.114 |
| 12.0 | 39.255 |
| 15.0 | 39.298 |
| 18.0 | 39.298 |
| 6.0 | 38.751 |
| 9.0 | 38.991 |
| 12.0 | 39.158 |
| 15.0 | 39.255 |
| 18.0 | 39.287 |
| 6.0 | 38.636 |
| 9.0 | 38.874 |
| 12.0 | 39.067 |
| 15.0 | 39.184 |
| 18.0 | 39.247 |
| 6.0 | 38.554 |
| 9.0 | 38.771 |
| 12.0 | 38.977 |
| 15.0 | 39.116 |
| 18.0 | 39.191 |
| 6.0 | 38.515 |
| 9.0 | 38.688 |
| 12.0 | 38.901 |
| 15.0 | 39.044 |
| 18.0 | 39.137 |
| 6.0 | 38.481 |
| 9.0 | 38.63 |
| 12.0 | 38.823 |
| 15.0 | 38.983 |
| 18.0 | 39.076 |
| 6.0 | 38.447 |
| 9.0 | 38.59 |
| 12.0 | 38.766 |
| 15.0 | 38.915 |
| 18.0 | 39.023 |
| 6.0 | 39.096 |
| 9.0 | 39.232 |
| 12.0 | 39.289 |
| 15.0 | 39.302 |
| 18.0 | 39.295 |
| 6.0 | 38.904 |
| 9.0 | 39.129 |
| 12.0 | 39.255 |
| 15.0 | 39.294 |
| 18.0 | 39.31 |
| 6.0 | 38.736 |
| 9.0 | 39.004 |
| 12.0 | 39.156 |
| 15.0 | 39.25 |
| 18.0 | 39.297 |
| 6.0 | 38.62 |
| 9.0 | 38.884 |
| 12.0 | 39.065 |
| 15.0 | 39.178 |
| 18.0 | 39.256 |
| 6.0 | 38.536 |
| 9.0 | 38.78 |
| 12.0 | 38.973 |
| 15.0 | 39.107 |
| 18.0 | 39.197 |
| 6.0 | 38.496 |
| 9.0 | 38.695 |
| 12.0 | 38.897 |
| 15.0 | 39.034 |
| 18.0 | 39.143 |
| 6.0 | 38.461 |
| 9.0 | 38.635 |
| 12.0 | 38.817 |
| 15.0 | 38.971 |
| 18.0 | 39.077 |
| 6.0 | 38.427 |
| 9.0 | 38.582 |
| 12.0 | 38.759 |
| 15.0 | 38.903 |
| 18.0 | 39.023 |
| 6.0 | 39.307 |
| 9.0 | 39.181 |
| 12.0 | 39.176 |
| 15.0 | 39.073 |
| 18.0 | 38.992 |
| 6.0 | 39.27 |
| 9.0 | 39.233 |
| 12.0 | 39.244 |
| 15.0 | 39.151 |
| 18.0 | 39.098 |
| 6.0 | 39.197 |
| 9.0 | 39.211 |
| 12.0 | 39.248 |
| 15.0 | 39.198 |
| 18.0 | 39.132 |
| 6.0 | 39.109 |
| 9.0 | 39.183 |
| 12.0 | 39.242 |
| 15.0 | 39.195 |
| 18.0 | 39.162 |
| 6.0 | 38.981 |
| 9.0 | 39.108 |
| 12.0 | 39.204 |
| 15.0 | 39.191 |
| 18.0 | 39.167 |
| 6.0 | 38.887 |
| 9.0 | 39.048 |
| 12.0 | 39.178 |
| 15.0 | 39.166 |
| 18.0 | 39.151 |
| 6.0 | 38.801 |
| 9.0 | 38.992 |
| 12.0 | 39.117 |
| 15.0 | 39.127 |
| 18.0 | 39.131 |
| 6.0 | 38.742 |
| 9.0 | 38.911 |
| 12.0 | 39.089 |
| 15.0 | 39.093 |
| 18.0 | 39.113 |
| 6.0 | 39.362 |
| 9.0 | 39.321 |
| 12.0 | 39.287 |
| 15.0 | 39.23 |
| 18.0 | 39.175 |
| 6.0 | 39.314 |
| 9.0 | 39.37 |
| 12.0 | 39.349 |
| 15.0 | 39.31 |
| 18.0 | 39.271 |
| 6.0 | 39.236 |
| 9.0 | 39.342 |
| 12.0 | 39.35 |
| 15.0 | 39.351 |
| 18.0 | 39.301 |
| 6.0 | 39.143 |
| 9.0 | 39.309 |
| 12.0 | 39.342 |
| 15.0 | 39.346 |
| 18.0 | 39.33 |
| 6.0 | 39.014 |
| 9.0 | 39.237 |
| 12.0 | 39.304 |
| 15.0 | 39.343 |
| 18.0 | 39.335 |
| 6.0 | 38.929 |
| 9.0 | 39.171 |
| 12.0 | 39.277 |
| 15.0 | 39.317 |
| 18.0 | 39.317 |
| 6.0 | 38.83 |
| 9.0 | 39.117 |
| 12.0 | 39.213 |
| 15.0 | 39.276 |
| 18.0 | 39.297 |
| 6.0 | 38.765 |
| 9.0 | 39.038 |
| 12.0 | 39.188 |
| 15.0 | 39.242 |
| 18.0 | 39.279 |
| 6.0 | 39.381 |
| 9.0 | 39.36 |
| 12.0 | 39.344 |
| 15.0 | 39.318 |
| 18.0 | 39.24 |
| 6.0 | 39.328 |
| 9.0 | 39.409 |
| 12.0 | 39.403 |
| 15.0 | 39.393 |
| 18.0 | 39.333 |
| 6.0 | 39.239 |
| 9.0 | 39.374 |
| 12.0 | 39.399 |
| 15.0 | 39.429 |
| 18.0 | 39.37 |
| 6.0 | 39.134 |
| 9.0 | 39.335 |
| 12.0 | 39.388 |
| 15.0 | 39.421 |
| 18.0 | 39.397 |
| 6.0 | 39.006 |
| 9.0 | 39.259 |
| 12.0 | 39.347 |
| 15.0 | 39.414 |
| 18.0 | 39.401 |
| 6.0 | 38.928 |
| 9.0 | 39.195 |
| 12.0 | 39.32 |
| 15.0 | 39.386 |
| 18.0 | 39.382 |
| 6.0 | 38.817 |
| 9.0 | 39.14 |
| 12.0 | 39.255 |
| 15.0 | 39.344 |
| 18.0 | 39.361 |
| 6.0 | 38.763 |
| 9.0 | 39.061 |
| 12.0 | 39.229 |
| 15.0 | 39.31 |
| 18.0 | 39.343 |
| 6.0 | 39.375 |
| 9.0 | 39.393 |
| 12.0 | 39.381 |
| 15.0 | 39.357 |
| 18.0 | 39.302 |
| 6.0 | 39.326 |
| 9.0 | 39.438 |
| 12.0 | 39.437 |
| 15.0 | 39.43 |
| 18.0 | 39.394 |
| 6.0 | 39.24 |
| 9.0 | 39.401 |
| 12.0 | 39.43 |
| 15.0 | 39.464 |
| 18.0 | 39.428 |
| 6.0 | 39.134 |
| 9.0 | 39.356 |
| 12.0 | 39.415 |
| 15.0 | 39.45 |
| 18.0 | 39.453 |
| 6.0 | 39.006 |
| 9.0 | 39.281 |
| 12.0 | 39.373 |
| 15.0 | 39.441 |
| 18.0 | 39.456 |
| 6.0 | 38.925 |
| 9.0 | 39.216 |
| 12.0 | 39.344 |
| 15.0 | 39.412 |
| 18.0 | 39.436 |
| 6.0 | 38.81 |
| 9.0 | 39.159 |
| 12.0 | 39.278 |
| 15.0 | 39.369 |
| 18.0 | 39.414 |
| 6.0 | 38.76 |
| 9.0 | 39.08 |
| 12.0 | 39.25 |
| 15.0 | 39.334 |
| 18.0 | 39.396 |
| 6.0 | 39.365 |
| 9.0 | 39.387 |
| 12.0 | 39.398 |
| 15.0 | 39.402 |
| 18.0 | 39.331 |
| 6.0 | 39.31 |
| 9.0 | 39.427 |
| 12.0 | 39.454 |
| 15.0 | 39.47 |
| 18.0 | 39.423 |
| 6.0 | 39.22 |
| 9.0 | 39.385 |
| 12.0 | 39.444 |
| 15.0 | 39.503 |
| 18.0 | 39.457 |
| 6.0 | 39.113 |
| 9.0 | 39.337 |
| 12.0 | 39.428 |
| 15.0 | 39.486 |
| 18.0 | 39.48 |
| 6.0 | 39.001 |
| 9.0 | 39.264 |
| 12.0 | 39.384 |
| 15.0 | 39.475 |
| 18.0 | 39.472 |
| 6.0 | 38.916 |
| 9.0 | 39.197 |
| 12.0 | 39.354 |
| 15.0 | 39.446 |
| 18.0 | 39.45 |
| 6.0 | 38.802 |
| 9.0 | 39.138 |
| 12.0 | 39.288 |
| 15.0 | 39.401 |
| 18.0 | 39.428 |
| 6.0 | 38.749 |
| 9.0 | 39.06 |
| 12.0 | 39.259 |
| 15.0 | 39.365 |
| 18.0 | 39.409 |
| 6.0 | 39.382 |
| 9.0 | 39.394 |
| 12.0 | 39.43 |
| 15.0 | 39.411 |
| 18.0 | 39.352 |
| 6.0 | 39.324 |
| 9.0 | 39.435 |
| 12.0 | 39.485 |
| 15.0 | 39.479 |
| 18.0 | 39.442 |
| 6.0 | 39.23 |
| 9.0 | 39.391 |
| 12.0 | 39.474 |
| 15.0 | 39.51 |
| 18.0 | 39.475 |
| 6.0 | 39.12 |
| 9.0 | 39.342 |
| 12.0 | 39.457 |
| 15.0 | 39.493 |
| 18.0 | 39.498 |
| 6.0 | 39.009 |
| 9.0 | 39.268 |
| 12.0 | 39.411 |
| 15.0 | 39.48 |
| 18.0 | 39.488 |
| 6.0 | 38.9 |
| 9.0 | 39.2 |
| 12.0 | 39.368 |
| 15.0 | 39.449 |
| 18.0 | 39.47 |
| 6.0 | 38.784 |
| 9.0 | 39.14 |
| 12.0 | 39.3 |
| 15.0 | 39.403 |
| 18.0 | 39.447 |
| 6.0 | 38.732 |
| 9.0 | 39.062 |
| 12.0 | 39.27 |
| 15.0 | 39.367 |
| 18.0 | 39.427 |
| 6.0 | 39.359 |
| 9.0 | 39.403 |
| 12.0 | 39.422 |
| 15.0 | 39.413 |
| 18.0 | 39.366 |
| 6.0 | 39.306 |
| 9.0 | 39.446 |
| 12.0 | 39.475 |
| 15.0 | 39.48 |
| 18.0 | 39.456 |
| 6.0 | 39.22 |
| 9.0 | 39.404 |
| 12.0 | 39.463 |
| 15.0 | 39.512 |
| 18.0 | 39.487 |
| 6.0 | 39.106 |
| 9.0 | 39.356 |
| 12.0 | 39.447 |
| 15.0 | 39.494 |
| 18.0 | 39.509 |
| 6.0 | 38.989 |
| 9.0 | 39.281 |
| 12.0 | 39.401 |
| 15.0 | 39.481 |
| 18.0 | 39.498 |
| 6.0 | 38.875 |
| 9.0 | 39.211 |
| 12.0 | 39.358 |
| 15.0 | 39.45 |
| 18.0 | 39.48 |
| 6.0 | 38.769 |
| 9.0 | 39.145 |
| 12.0 | 39.299 |
| 15.0 | 39.409 |
| 18.0 | 39.461 |
| 6.0 | 38.716 |
| 9.0 | 39.066 |
| 12.0 | 39.268 |
| 15.0 | 39.372 |
| 18.0 | 39.44 |
| 6.0 | 39.361 |
| 9.0 | 39.401 |
| 12.0 | 39.446 |
| 15.0 | 39.425 |
| 18.0 | 39.382 |
| 6.0 | 39.301 |
| 9.0 | 39.44 |
| 12.0 | 39.5 |
| 15.0 | 39.491 |
| 18.0 | 39.471 |
| 6.0 | 39.207 |
| 9.0 | 39.396 |
| 12.0 | 39.489 |
| 15.0 | 39.522 |
| 18.0 | 39.503 |
| 6.0 | 39.095 |
| 9.0 | 39.345 |
| 12.0 | 39.472 |
| 15.0 | 39.504 |
| 18.0 | 39.525 |
| 6.0 | 38.983 |
| 9.0 | 39.269 |
| 12.0 | 39.427 |
| 15.0 | 39.49 |
| 18.0 | 39.513 |
| 6.0 | 38.874 |
| 9.0 | 39.199 |
| 12.0 | 39.382 |
| 15.0 | 39.458 |
| 18.0 | 39.494 |
| 6.0 | 38.774 |
| 9.0 | 39.133 |
| 12.0 | 39.322 |
| 15.0 | 39.417 |
| 18.0 | 39.474 |
| 6.0 | 38.714 |
| 9.0 | 39.056 |
| 12.0 | 39.273 |
| 15.0 | 39.376 |
| 18.0 | 39.443 |
| 6.0 | 39.264 |
| 9.0 | 39.215 |
| 12.0 | 39.13 |
| 15.0 | 39.118 |
| 18.0 | 39.046 |
| 6.0 | 39.293 |
| 9.0 | 39.319 |
| 12.0 | 39.241 |
| 15.0 | 39.221 |
| 18.0 | 39.168 |
| 6.0 | 39.278 |
| 9.0 | 39.335 |
| 12.0 | 39.291 |
| 15.0 | 39.293 |
| 18.0 | 39.235 |
| 6.0 | 39.251 |
| 9.0 | 39.332 |
| 12.0 | 39.309 |
| 15.0 | 39.324 |
| 18.0 | 39.281 |
| 6.0 | 39.194 |
| 9.0 | 39.314 |
| 12.0 | 39.31 |
| 15.0 | 39.34 |
| 18.0 | 39.302 |
| 6.0 | 39.149 |
| 9.0 | 39.293 |
| 12.0 | 39.308 |
| 15.0 | 39.336 |
| 18.0 | 39.313 |
| 6.0 | 39.097 |
| 9.0 | 39.262 |
| 12.0 | 39.295 |
| 15.0 | 39.344 |
| 18.0 | 39.317 |
| 6.0 | 39.053 |
| 9.0 | 39.216 |
| 12.0 | 39.275 |
| 15.0 | 39.327 |
| 18.0 | 39.308 |
| 6.0 | 39.308 |
| 9.0 | 39.292 |
| 12.0 | 39.204 |
| 15.0 | 39.205 |
| 18.0 | 39.138 |
| 6.0 | 39.328 |
| 9.0 | 39.389 |
| 12.0 | 39.31 |
| 15.0 | 39.304 |
| 18.0 | 39.258 |
| 6.0 | 39.308 |
| 9.0 | 39.402 |
| 12.0 | 39.356 |
| 15.0 | 39.373 |
| 18.0 | 39.322 |
| 6.0 | 39.279 |
| 9.0 | 39.396 |
| 12.0 | 39.369 |
| 15.0 | 39.402 |
| 18.0 | 39.367 |
| 6.0 | 39.221 |
| 9.0 | 39.378 |
| 12.0 | 39.369 |
| 15.0 | 39.416 |
| 18.0 | 39.388 |
| 6.0 | 39.176 |
| 9.0 | 39.356 |
| 12.0 | 39.366 |
| 15.0 | 39.413 |
| 18.0 | 39.398 |
| 6.0 | 39.123 |
| 9.0 | 39.325 |
| 12.0 | 39.353 |
| 15.0 | 39.42 |
| 18.0 | 39.402 |
| 6.0 | 39.079 |
| 9.0 | 39.278 |
| 12.0 | 39.333 |
| 15.0 | 39.402 |
| 18.0 | 39.392 |
| 6.0 | 39.317 |
| 9.0 | 39.323 |
| 12.0 | 39.238 |
| 15.0 | 39.24 |
| 18.0 | 39.194 |
| 6.0 | 39.331 |
| 9.0 | 39.416 |
| 12.0 | 39.341 |
| 15.0 | 39.336 |
| 18.0 | 39.311 |
| 6.0 | 39.306 |
| 9.0 | 39.424 |
| 12.0 | 39.382 |
| 15.0 | 39.402 |
| 18.0 | 39.374 |
| 6.0 | 39.272 |
| 9.0 | 39.415 |
| 12.0 | 39.393 |
| 15.0 | 39.43 |
| 18.0 | 39.416 |
| 6.0 | 39.214 |
| 9.0 | 39.395 |
| 12.0 | 39.392 |
| 15.0 | 39.442 |
| 18.0 | 39.436 |
| 6.0 | 39.167 |
| 9.0 | 39.372 |
| 12.0 | 39.387 |
| 15.0 | 39.438 |
| 18.0 | 39.445 |
| 6.0 | 39.114 |
| 9.0 | 39.341 |
| 12.0 | 39.374 |
| 15.0 | 39.444 |
| 18.0 | 39.448 |
| 6.0 | 39.069 |
| 9.0 | 39.294 |
| 12.0 | 39.354 |
| 15.0 | 39.426 |
| 18.0 | 39.438 |
| 6.0 | 39.323 |
| 9.0 | 39.337 |
| 12.0 | 39.266 |
| 15.0 | 39.28 |
| 18.0 | 39.221 |
| 6.0 | 39.335 |
| 9.0 | 39.427 |
| 12.0 | 39.366 |
| 15.0 | 39.375 |
| 18.0 | 39.336 |
| 6.0 | 39.307 |
| 9.0 | 39.432 |
| 12.0 | 39.405 |
| 15.0 | 39.438 |
| 18.0 | 39.397 |
| 6.0 | 39.27 |
| 9.0 | 39.42 |
| 12.0 | 39.413 |
| 15.0 | 39.464 |
| 18.0 | 39.438 |
| 6.0 | 39.21 |
| 9.0 | 39.399 |
| 12.0 | 39.41 |
| 15.0 | 39.475 |
| 18.0 | 39.456 |
| 6.0 | 39.159 |
| 9.0 | 39.375 |
| 12.0 | 39.404 |
| 15.0 | 39.469 |
| 18.0 | 39.465 |
| 6.0 | 39.109 |
| 9.0 | 39.342 |
| 12.0 | 39.39 |
| 15.0 | 39.475 |
| 18.0 | 39.468 |
| 6.0 | 39.064 |
| 9.0 | 39.295 |
| 12.0 | 39.369 |
| 15.0 | 39.457 |
| 18.0 | 39.457 |
| 6.0 | 39.308 |
| 9.0 | 39.342 |
| 12.0 | 39.282 |
| 15.0 | 39.308 |
| 18.0 | 39.251 |
| 6.0 | 39.319 |
| 9.0 | 39.431 |
| 12.0 | 39.381 |
| 15.0 | 39.4 |
| 18.0 | 39.366 |
| 6.0 | 39.289 |
| 9.0 | 39.434 |
| 12.0 | 39.419 |
| 15.0 | 39.463 |
| 18.0 | 39.425 |
| 6.0 | 39.251 |
| 9.0 | 39.421 |
| 12.0 | 39.424 |
| 15.0 | 39.487 |
| 18.0 | 39.465 |
| 6.0 | 39.189 |
| 9.0 | 39.397 |
| 12.0 | 39.42 |
| 15.0 | 39.496 |
| 18.0 | 39.482 |
| 6.0 | 39.137 |
| 9.0 | 39.372 |
| 12.0 | 39.413 |
| 15.0 | 39.489 |
| 18.0 | 39.489 |
| 6.0 | 39.086 |
| 9.0 | 39.338 |
| 12.0 | 39.398 |
| 15.0 | 39.494 |
| 18.0 | 39.491 |
| 6.0 | 39.038 |
| 9.0 | 39.291 |
| 12.0 | 39.377 |
| 15.0 | 39.474 |
| 18.0 | 39.48 |
| 6.0 | 39.307 |
| 9.0 | 39.349 |
| 12.0 | 39.296 |
| 15.0 | 39.318 |
| 18.0 | 39.273 |
| 6.0 | 39.317 |
| 9.0 | 39.438 |
| 12.0 | 39.395 |
| 15.0 | 39.411 |
| 18.0 | 39.387 |
| 6.0 | 39.287 |
| 9.0 | 39.44 |
| 12.0 | 39.431 |
| 15.0 | 39.472 |
| 18.0 | 39.445 |
| 6.0 | 39.248 |
| 9.0 | 39.425 |
| 12.0 | 39.435 |
| 15.0 | 39.495 |
| 18.0 | 39.485 |
| 6.0 | 39.186 |
| 9.0 | 39.4 |
| 12.0 | 39.43 |
| 15.0 | 39.503 |
| 18.0 | 39.5 |
| 6.0 | 39.132 |
| 9.0 | 39.373 |
| 12.0 | 39.422 |
| 15.0 | 39.495 |
| 18.0 | 39.506 |
| 6.0 | 39.08 |
| 9.0 | 39.339 |
| 12.0 | 39.405 |
| 15.0 | 39.498 |
| 18.0 | 39.508 |
| 6.0 | 39.031 |
| 9.0 | 39.291 |
| 12.0 | 39.384 |
| 15.0 | 39.479 |
| 18.0 | 39.496 |
| 6.0 | 39.301 |
| 9.0 | 39.349 |
| 12.0 | 39.304 |
| 15.0 | 39.341 |
| 18.0 | 39.29 |
| 6.0 | 39.311 |
| 9.0 | 39.438 |
| 12.0 | 39.401 |
| 15.0 | 39.432 |
| 18.0 | 39.404 |
| 6.0 | 39.28 |
| 9.0 | 39.439 |
| 12.0 | 39.437 |
| 15.0 | 39.489 |
| 18.0 | 39.461 |
| 6.0 | 39.241 |
| 9.0 | 39.424 |
| 12.0 | 39.44 |
| 15.0 | 39.515 |
| 18.0 | 39.5 |
| 6.0 | 39.178 |
| 9.0 | 39.398 |
| 12.0 | 39.434 |
| 15.0 | 39.522 |
| 18.0 | 39.515 |
| 6.0 | 39.124 |
| 9.0 | 39.37 |
| 12.0 | 39.425 |
| 15.0 | 39.513 |
| 18.0 | 39.52 |
| 6.0 | 39.071 |
| 9.0 | 39.335 |
| 12.0 | 39.408 |
| 15.0 | 39.516 |
| 18.0 | 39.521 |
| 6.0 | 39.022 |
| 9.0 | 39.286 |
| 12.0 | 39.385 |
| 15.0 | 39.496 |
| 18.0 | 39.509 |
| 6.0 | 39.298 |
| 9.0 | 39.337 |
| 12.0 | 39.307 |
| 15.0 | 39.341 |
| 18.0 | 39.294 |
| 6.0 | 39.308 |
| 9.0 | 39.425 |
| 12.0 | 39.404 |
| 15.0 | 39.432 |
| 18.0 | 39.408 |
| 6.0 | 39.277 |
| 9.0 | 39.426 |
| 12.0 | 39.439 |
| 15.0 | 39.488 |
| 18.0 | 39.465 |
| 6.0 | 39.237 |
| 9.0 | 39.41 |
| 12.0 | 39.442 |
| 15.0 | 39.51 |
| 18.0 | 39.504 |
| 6.0 | 39.174 |
| 9.0 | 39.384 |
| 12.0 | 39.436 |
| 15.0 | 39.52 |
| 18.0 | 39.518 |
| 6.0 | 39.119 |
| 9.0 | 39.356 |
| 12.0 | 39.426 |
| 15.0 | 39.51 |
| 18.0 | 39.523 |
| 6.0 | 39.066 |
| 9.0 | 39.321 |
| 12.0 | 39.408 |
| 15.0 | 39.513 |
| 18.0 | 39.522 |
| 6.0 | 39.016 |
| 9.0 | 39.272 |
| 12.0 | 39.385 |
| 15.0 | 39.493 |
| 18.0 | 39.51 |
| 6.0 | 39.176 |
| 9.0 | 39.111 |
| 12.0 | 39.074 |
| 15.0 | 39.046 |
| 18.0 | 38.998 |
| 6.0 | 39.205 |
| 9.0 | 39.215 |
| 12.0 | 39.181 |
| 15.0 | 39.157 |
| 18.0 | 39.125 |
| 6.0 | 39.189 |
| 9.0 | 39.229 |
| 12.0 | 39.227 |
| 15.0 | 39.235 |
| 18.0 | 39.193 |
| 6.0 | 39.137 |
| 9.0 | 39.23 |
| 12.0 | 39.254 |
| 15.0 | 39.253 |
| 18.0 | 39.247 |
| 6.0 | 39.089 |
| 9.0 | 39.203 |
| 12.0 | 39.251 |
| 15.0 | 39.276 |
| 18.0 | 39.265 |
| 6.0 | 39.032 |
| 9.0 | 39.172 |
| 12.0 | 39.24 |
| 15.0 | 39.274 |
| 18.0 | 39.271 |
| 6.0 | 38.977 |
| 9.0 | 39.141 |
| 12.0 | 39.215 |
| 15.0 | 39.263 |
| 18.0 | 39.274 |
| 6.0 | 38.934 |
| 9.0 | 39.095 |
| 12.0 | 39.193 |
| 15.0 | 39.25 |
| 18.0 | 39.273 |
| 6.0 | 39.171 |
| 9.0 | 39.167 |
| 12.0 | 39.142 |
| 15.0 | 39.094 |
| 18.0 | 39.035 |
| 6.0 | 39.19 |
| 9.0 | 39.268 |
| 12.0 | 39.244 |
| 15.0 | 39.21 |
| 18.0 | 39.162 |
| 6.0 | 39.165 |
| 9.0 | 39.277 |
| 12.0 | 39.287 |
| 15.0 | 39.281 |
| 18.0 | 39.226 |
| 6.0 | 39.115 |
| 9.0 | 39.277 |
| 12.0 | 39.313 |
| 15.0 | 39.298 |
| 18.0 | 39.279 |
| 6.0 | 39.063 |
| 9.0 | 39.244 |
| 12.0 | 39.309 |
| 15.0 | 39.319 |
| 18.0 | 39.298 |
| 6.0 | 39.005 |
| 9.0 | 39.213 |
| 12.0 | 39.299 |
| 15.0 | 39.316 |
| 18.0 | 39.302 |
| 6.0 | 38.951 |
| 9.0 | 39.184 |
| 12.0 | 39.271 |
| 15.0 | 39.306 |
| 18.0 | 39.305 |
| 6.0 | 38.906 |
| 9.0 | 39.138 |
| 12.0 | 39.248 |
| 15.0 | 39.292 |
| 18.0 | 39.305 |
| 6.0 | 39.145 |
| 9.0 | 39.159 |
| 12.0 | 39.153 |
| 15.0 | 39.142 |
| 18.0 | 39.08 |
| 6.0 | 39.157 |
| 9.0 | 39.25 |
| 12.0 | 39.254 |
| 15.0 | 39.254 |
| 18.0 | 39.199 |
| 6.0 | 39.129 |
| 9.0 | 39.256 |
| 12.0 | 39.289 |
| 15.0 | 39.322 |
| 18.0 | 39.266 |
| 6.0 | 39.075 |
| 9.0 | 39.252 |
| 12.0 | 39.311 |
| 15.0 | 39.337 |
| 18.0 | 39.316 |
| 6.0 | 39.022 |
| 9.0 | 39.221 |
| 12.0 | 39.305 |
| 15.0 | 39.357 |
| 18.0 | 39.332 |
| 6.0 | 38.962 |
| 9.0 | 39.188 |
| 12.0 | 39.296 |
| 15.0 | 39.354 |
| 18.0 | 39.337 |
| 6.0 | 38.905 |
| 9.0 | 39.159 |
| 12.0 | 39.266 |
| 15.0 | 39.342 |
| 18.0 | 39.339 |
| 6.0 | 38.864 |
| 9.0 | 39.112 |
| 12.0 | 39.242 |
| 15.0 | 39.329 |
| 18.0 | 39.338 |
| 6.0 | 39.107 |
| 9.0 | 39.158 |
| 12.0 | 39.162 |
| 15.0 | 39.142 |
| 18.0 | 39.115 |
| 6.0 | 39.113 |
| 9.0 | 39.244 |
| 12.0 | 39.26 |
| 15.0 | 39.252 |
| 18.0 | 39.233 |
| 6.0 | 39.081 |
| 9.0 | 39.244 |
| 12.0 | 39.291 |
| 15.0 | 39.318 |
| 18.0 | 39.297 |
| 6.0 | 39.023 |
| 9.0 | 39.237 |
| 12.0 | 39.31 |
| 15.0 | 39.331 |
| 18.0 | 39.346 |
| 6.0 | 38.967 |
| 9.0 | 39.204 |
| 12.0 | 39.303 |
| 15.0 | 39.349 |
| 18.0 | 39.36 |
| 6.0 | 38.905 |
| 9.0 | 39.17 |
| 12.0 | 39.294 |
| 15.0 | 39.344 |
| 18.0 | 39.364 |
| 6.0 | 38.849 |
| 9.0 | 39.14 |
| 12.0 | 39.264 |
| 15.0 | 39.331 |
| 18.0 | 39.366 |
| 6.0 | 38.808 |
| 9.0 | 39.093 |
| 12.0 | 39.239 |
| 15.0 | 39.317 |
| 18.0 | 39.364 |
| 6.0 | 39.091 |
| 9.0 | 39.13 |
| 12.0 | 39.15 |
| 15.0 | 39.154 |
| 18.0 | 39.115 |
| 6.0 | 39.097 |
| 9.0 | 39.215 |
| 12.0 | 39.246 |
| 15.0 | 39.258 |
| 18.0 | 39.236 |
| 6.0 | 39.066 |
| 9.0 | 39.214 |
| 12.0 | 39.275 |
| 15.0 | 39.322 |
| 18.0 | 39.292 |
| 6.0 | 39.008 |
| 9.0 | 39.207 |
| 12.0 | 39.293 |
| 15.0 | 39.333 |
| 18.0 | 39.345 |
| 6.0 | 38.944 |
| 9.0 | 39.17 |
| 12.0 | 39.284 |
| 15.0 | 39.35 |
| 18.0 | 39.357 |
| 6.0 | 38.88 |
| 9.0 | 39.134 |
| 12.0 | 39.275 |
| 15.0 | 39.344 |
| 18.0 | 39.361 |
| 6.0 | 38.823 |
| 9.0 | 39.103 |
| 12.0 | 39.245 |
| 15.0 | 39.331 |
| 18.0 | 39.362 |
| 6.0 | 38.78 |
| 9.0 | 39.055 |
| 12.0 | 39.22 |
| 15.0 | 39.316 |
| 18.0 | 39.359 |
| 6.0 | 39.084 |
| 9.0 | 39.111 |
| 12.0 | 39.161 |
| 15.0 | 39.154 |
| 18.0 | 39.116 |
| 6.0 | 39.089 |
| 9.0 | 39.194 |
| 12.0 | 39.251 |
| 15.0 | 39.256 |
| 18.0 | 39.234 |
| 6.0 | 39.055 |
| 9.0 | 39.19 |
| 12.0 | 39.274 |
| 15.0 | 39.318 |
| 18.0 | 39.288 |
| 6.0 | 38.996 |
| 9.0 | 39.181 |
| 12.0 | 39.289 |
| 15.0 | 39.329 |
| 18.0 | 39.339 |
| 6.0 | 38.93 |
| 9.0 | 39.142 |
| 12.0 | 39.275 |
| 15.0 | 39.343 |
| 18.0 | 39.349 |
| 6.0 | 38.865 |
| 9.0 | 39.105 |
| 12.0 | 39.261 |
| 15.0 | 39.336 |
| 18.0 | 39.353 |
| 6.0 | 38.808 |
| 9.0 | 39.073 |
| 12.0 | 39.231 |
| 15.0 | 39.322 |
| 18.0 | 39.353 |
| 6.0 | 38.766 |
| 9.0 | 39.024 |
| 12.0 | 39.205 |
| 15.0 | 39.307 |
| 18.0 | 39.35 |
| 6.0 | 39.082 |
| 9.0 | 39.105 |
| 12.0 | 39.137 |
| 15.0 | 39.144 |
| 18.0 | 39.122 |
| 6.0 | 39.084 |
| 9.0 | 39.186 |
| 12.0 | 39.225 |
| 15.0 | 39.244 |
| 18.0 | 39.24 |
| 6.0 | 39.042 |
| 9.0 | 39.18 |
| 12.0 | 39.248 |
| 15.0 | 39.306 |
| 18.0 | 39.293 |
| 6.0 | 38.98 |
| 9.0 | 39.169 |
| 12.0 | 39.263 |
| 15.0 | 39.315 |
| 18.0 | 39.342 |
| 6.0 | 38.913 |
| 9.0 | 39.129 |
| 12.0 | 39.251 |
| 15.0 | 39.328 |
| 18.0 | 39.352 |
| 6.0 | 38.847 |
| 9.0 | 39.091 |
| 12.0 | 39.236 |
| 15.0 | 39.32 |
| 18.0 | 39.355 |
| 6.0 | 38.792 |
| 9.0 | 39.054 |
| 12.0 | 39.205 |
| 15.0 | 39.306 |
| 18.0 | 39.353 |
| 6.0 | 38.748 |
| 9.0 | 39.008 |
| 12.0 | 39.174 |
| 15.0 | 39.29 |
| 18.0 | 39.348 |
| 6.0 | 39.081 |
| 9.0 | 39.094 |
| 12.0 | 39.121 |
| 15.0 | 39.138 |
| 18.0 | 39.117 |
| 6.0 | 39.076 |
| 9.0 | 39.174 |
| 12.0 | 39.209 |
| 15.0 | 39.237 |
| 18.0 | 39.235 |
| 6.0 | 39.035 |
| 9.0 | 39.168 |
| 12.0 | 39.232 |
| 15.0 | 39.297 |
| 18.0 | 39.289 |
| 6.0 | 38.971 |
| 9.0 | 39.156 |
| 12.0 | 39.246 |
| 15.0 | 39.305 |
| 18.0 | 39.339 |
| 6.0 | 38.904 |
| 9.0 | 39.115 |
| 12.0 | 39.234 |
| 15.0 | 39.318 |
| 18.0 | 39.348 |
| 6.0 | 38.836 |
| 9.0 | 39.076 |
| 12.0 | 39.219 |
| 15.0 | 39.31 |
| 18.0 | 39.352 |
| 6.0 | 38.78 |
| 9.0 | 39.042 |
| 12.0 | 39.186 |
| 15.0 | 39.294 |
| 18.0 | 39.349 |
| 6.0 | 38.737 |
| 9.0 | 38.991 |
| 12.0 | 39.158 |
| 15.0 | 39.277 |
| 18.0 | 39.336 |
| 6.0 | 38.992 |
| 9.0 | 39.001 |
| 12.0 | 38.974 |
| 15.0 | 38.928 |
| 18.0 | 38.875 |
| 6.0 | 38.978 |
| 9.0 | 39.044 |
| 12.0 | 39.046 |
| 15.0 | 39.014 |
| 18.0 | 38.985 |
| 6.0 | 38.931 |
| 9.0 | 39.043 |
| 12.0 | 39.07 |
| 15.0 | 39.057 |
| 18.0 | 39.045 |
| 6.0 | 38.875 |
| 9.0 | 39.024 |
| 12.0 | 39.071 |
| 15.0 | 39.088 |
| 18.0 | 39.077 |
| 6.0 | 38.854 |
| 9.0 | 38.987 |
| 12.0 | 39.043 |
| 15.0 | 39.09 |
| 18.0 | 39.091 |
| 6.0 | 38.846 |
| 9.0 | 38.946 |
| 12.0 | 39.03 |
| 15.0 | 39.072 |
| 18.0 | 39.081 |
| 6.0 | 38.802 |
| 9.0 | 38.935 |
| 12.0 | 39.004 |
| 15.0 | 39.049 |
| 18.0 | 39.065 |
| 6.0 | 38.799 |
| 9.0 | 38.913 |
| 12.0 | 38.98 |
| 15.0 | 39.028 |
| 18.0 | 39.052 |
| 6.0 | 38.917 |
| 9.0 | 38.982 |
| 12.0 | 38.979 |
| 15.0 | 38.95 |
| 18.0 | 38.903 |
| 6.0 | 38.895 |
| 9.0 | 39.016 |
| 12.0 | 39.046 |
| 15.0 | 39.046 |
| 18.0 | 39.006 |
| 6.0 | 38.841 |
| 9.0 | 39.005 |
| 12.0 | 39.064 |
| 15.0 | 39.086 |
| 18.0 | 39.063 |
| 6.0 | 38.78 |
| 9.0 | 38.987 |
| 12.0 | 39.063 |
| 15.0 | 39.116 |
| 18.0 | 39.095 |
| 6.0 | 38.756 |
| 9.0 | 38.948 |
| 12.0 | 39.036 |
| 15.0 | 39.116 |
| 18.0 | 39.109 |
| 6.0 | 38.742 |
| 9.0 | 38.9 |
| 12.0 | 39.022 |
| 15.0 | 39.097 |
| 18.0 | 39.097 |
| 6.0 | 38.699 |
| 9.0 | 38.891 |
| 12.0 | 38.994 |
| 15.0 | 39.072 |
| 18.0 | 39.081 |
| 6.0 | 38.694 |
| 9.0 | 38.867 |
| 12.0 | 38.969 |
| 15.0 | 39.048 |
| 18.0 | 39.067 |
| 6.0 | 38.873 |
| 9.0 | 38.933 |
| 12.0 | 38.956 |
| 15.0 | 38.95 |
| 18.0 | 38.918 |
| 6.0 | 38.84 |
| 9.0 | 38.957 |
| 12.0 | 39.019 |
| 15.0 | 39.043 |
| 18.0 | 39.017 |
| 6.0 | 38.78 |
| 9.0 | 38.956 |
| 12.0 | 39.044 |
| 15.0 | 39.08 |
| 18.0 | 39.077 |
| 6.0 | 38.715 |
| 9.0 | 38.935 |
| 12.0 | 39.039 |
| 15.0 | 39.108 |
| 18.0 | 39.106 |
| 6.0 | 38.689 |
| 9.0 | 38.894 |
| 12.0 | 39.011 |
| 15.0 | 39.107 |
| 18.0 | 39.119 |
| 6.0 | 38.669 |
| 9.0 | 38.844 |
| 12.0 | 38.995 |
| 15.0 | 39.083 |
| 18.0 | 39.107 |
| 6.0 | 38.627 |
| 9.0 | 38.833 |
| 12.0 | 38.966 |
| 15.0 | 39.056 |
| 18.0 | 39.09 |
| 6.0 | 38.621 |
| 9.0 | 38.808 |
| 12.0 | 38.94 |
| 15.0 | 39.036 |
| 18.0 | 39.075 |
| 6.0 | 38.826 |
| 9.0 | 38.922 |
| 12.0 | 38.925 |
| 15.0 | 38.952 |
| 18.0 | 38.914 |
| 6.0 | 38.784 |
| 9.0 | 38.937 |
| 12.0 | 38.984 |
| 15.0 | 39.04 |
| 18.0 | 39.011 |
| 6.0 | 38.718 |
| 9.0 | 38.93 |
| 12.0 | 39.005 |
| 15.0 | 39.075 |
| 18.0 | 39.069 |
| 6.0 | 38.662 |
| 9.0 | 38.893 |
| 12.0 | 38.997 |
| 15.0 | 39.085 |
| 18.0 | 39.096 |
| 6.0 | 38.633 |
| 9.0 | 38.849 |
| 12.0 | 38.967 |
| 15.0 | 39.078 |
| 18.0 | 39.107 |
| 6.0 | 38.61 |
| 9.0 | 38.798 |
| 12.0 | 38.946 |
| 15.0 | 39.056 |
| 18.0 | 39.094 |
| 6.0 | 38.566 |
| 9.0 | 38.784 |
| 12.0 | 38.92 |
| 15.0 | 39.029 |
| 18.0 | 39.076 |
| 6.0 | 38.558 |
| 9.0 | 38.758 |
| 12.0 | 38.893 |
| 15.0 | 39.008 |
| 18.0 | 39.061 |
| 6.0 | 38.797 |
| 9.0 | 38.9 |
| 12.0 | 38.896 |
| 15.0 | 38.933 |
| 18.0 | 38.911 |
| 6.0 | 38.752 |
| 9.0 | 38.909 |
| 12.0 | 38.949 |
| 15.0 | 39.017 |
| 18.0 | 39.005 |
| 6.0 | 38.681 |
| 9.0 | 38.897 |
| 12.0 | 38.967 |
| 15.0 | 39.046 |
| 18.0 | 39.062 |
| 6.0 | 38.62 |
| 9.0 | 38.857 |
| 12.0 | 38.956 |
| 15.0 | 39.054 |
| 18.0 | 39.087 |
| 6.0 | 38.584 |
| 9.0 | 38.81 |
| 12.0 | 38.919 |
| 15.0 | 39.049 |
| 18.0 | 39.091 |
| 6.0 | 38.558 |
| 9.0 | 38.758 |
| 12.0 | 38.9 |
| 15.0 | 39.025 |
| 18.0 | 39.076 |
| 6.0 | 38.514 |
| 9.0 | 38.743 |
| 12.0 | 38.873 |
| 15.0 | 38.997 |
| 18.0 | 39.057 |
| 6.0 | 38.504 |
| 9.0 | 38.717 |
| 12.0 | 38.845 |
| 15.0 | 38.975 |
| 18.0 | 39.042 |
| 6.0 | 38.814 |
| 9.0 | 38.859 |
| 12.0 | 38.891 |
| 15.0 | 38.905 |
| 18.0 | 38.885 |
| 6.0 | 38.764 |
| 9.0 | 38.866 |
| 12.0 | 38.94 |
| 15.0 | 38.983 |
| 18.0 | 38.976 |
| 6.0 | 38.692 |
| 9.0 | 38.851 |
| 12.0 | 38.953 |
| 15.0 | 39.01 |
| 18.0 | 39.03 |
| 6.0 | 38.626 |
| 9.0 | 38.809 |
| 12.0 | 38.94 |
| 15.0 | 39.015 |
| 18.0 | 39.053 |
| 6.0 | 38.589 |
| 9.0 | 38.762 |
| 12.0 | 38.902 |
| 15.0 | 39.008 |
| 18.0 | 39.056 |
| 6.0 | 38.548 |
| 9.0 | 38.717 |
| 12.0 | 38.881 |
| 15.0 | 38.984 |
| 18.0 | 39.049 |
| 6.0 | 38.503 |
| 9.0 | 38.7 |
| 12.0 | 38.852 |
| 15.0 | 38.954 |
| 18.0 | 39.024 |
| 6.0 | 38.492 |
| 9.0 | 38.673 |
| 12.0 | 38.823 |
| 15.0 | 38.93 |
| 18.0 | 39.008 |
| 6.0 | 38.796 |
| 9.0 | 38.856 |
| 12.0 | 38.885 |
| 15.0 | 38.888 |
| 18.0 | 38.86 |
| 6.0 | 38.748 |
| 9.0 | 38.863 |
| 12.0 | 38.931 |
| 15.0 | 38.963 |
| 18.0 | 38.946 |
| 6.0 | 38.674 |
| 9.0 | 38.845 |
| 12.0 | 38.94 |
| 15.0 | 38.992 |
| 18.0 | 38.999 |
| 6.0 | 38.608 |
| 9.0 | 38.799 |
| 12.0 | 38.922 |
| 15.0 | 38.992 |
| 18.0 | 39.02 |
| 6.0 | 38.569 |
| 9.0 | 38.748 |
| 12.0 | 38.886 |
| 15.0 | 38.984 |
| 18.0 | 39.022 |
| 6.0 | 38.526 |
| 9.0 | 38.701 |
| 12.0 | 38.862 |
| 15.0 | 38.959 |
| 18.0 | 39.01 |
| 6.0 | 38.489 |
| 9.0 | 38.668 |
| 12.0 | 38.821 |
| 15.0 | 38.941 |
| 18.0 | 38.987 |
| 6.0 | 38.477 |
| 9.0 | 38.64 |
| 12.0 | 38.791 |
| 15.0 | 38.917 |
| 18.0 | 38.97 |
| 6.0 | 38.802 |
| 9.0 | 38.835 |
| 12.0 | 38.87 |
| 15.0 | 38.886 |
| 18.0 | 38.854 |
| 6.0 | 38.752 |
| 9.0 | 38.84 |
| 12.0 | 38.912 |
| 15.0 | 38.958 |
| 18.0 | 38.939 |
| 6.0 | 38.676 |
| 9.0 | 38.819 |
| 12.0 | 38.919 |
| 15.0 | 38.985 |
| 18.0 | 38.989 |
| 6.0 | 38.608 |
| 9.0 | 38.771 |
| 12.0 | 38.899 |
| 15.0 | 38.98 |
| 18.0 | 39.009 |
| 6.0 | 38.567 |
| 9.0 | 38.718 |
| 12.0 | 38.862 |
| 15.0 | 38.97 |
| 18.0 | 39.01 |
| 6.0 | 38.523 |
| 9.0 | 38.669 |
| 12.0 | 38.837 |
| 15.0 | 38.943 |
| 18.0 | 38.997 |
| 6.0 | 38.485 |
| 9.0 | 38.635 |
| 12.0 | 38.795 |
| 15.0 | 38.924 |
| 18.0 | 38.972 |
| 6.0 | 38.462 |
| 9.0 | 38.606 |
| 12.0 | 38.764 |
| 15.0 | 38.886 |
| 18.0 | 38.948 |
| 6.0 | 38.864 |
| 9.0 | 38.869 |
| 12.0 | 38.888 |
| 15.0 | 38.839 |
| 18.0 | 38.791 |
| 6.0 | 38.866 |
| 9.0 | 38.942 |
| 12.0 | 38.966 |
| 15.0 | 38.949 |
| 18.0 | 38.906 |
| 6.0 | 38.858 |
| 9.0 | 38.934 |
| 12.0 | 38.977 |
| 15.0 | 38.997 |
| 18.0 | 38.952 |
| 6.0 | 38.847 |
| 9.0 | 38.939 |
| 12.0 | 38.987 |
| 15.0 | 38.987 |
| 18.0 | 38.99 |
| 6.0 | 38.824 |
| 9.0 | 38.908 |
| 12.0 | 38.976 |
| 15.0 | 38.997 |
| 18.0 | 38.986 |
| 6.0 | 38.801 |
| 9.0 | 38.904 |
| 12.0 | 38.972 |
| 15.0 | 38.983 |
| 18.0 | 38.981 |
| 6.0 | 38.805 |
| 9.0 | 38.901 |
| 12.0 | 38.947 |
| 15.0 | 38.976 |
| 18.0 | 38.972 |
| 6.0 | 38.804 |
| 9.0 | 38.882 |
| 12.0 | 38.944 |
| 15.0 | 38.962 |
| 18.0 | 38.963 |
| 6.0 | 38.766 |
| 9.0 | 38.823 |
| 12.0 | 38.866 |
| 15.0 | 38.845 |
| 18.0 | 38.819 |
| 6.0 | 38.754 |
| 9.0 | 38.884 |
| 12.0 | 38.938 |
| 15.0 | 38.942 |
| 18.0 | 38.932 |
| 6.0 | 38.738 |
| 9.0 | 38.87 |
| 12.0 | 38.941 |
| 15.0 | 38.99 |
| 18.0 | 38.975 |
| 6.0 | 38.721 |
| 9.0 | 38.874 |
| 12.0 | 38.951 |
| 15.0 | 38.978 |
| 18.0 | 39.008 |
| 6.0 | 38.692 |
| 9.0 | 38.838 |
| 12.0 | 38.937 |
| 15.0 | 38.985 |
| 18.0 | 39.002 |
| 6.0 | 38.667 |
| 9.0 | 38.833 |
| 12.0 | 38.932 |
| 15.0 | 38.969 |
| 18.0 | 39 |
| 6.0 | 38.673 |
| 9.0 | 38.826 |
| 12.0 | 38.904 |
| 15.0 | 38.959 |
| 18.0 | 38.99 |
| 6.0 | 38.668 |
| 9.0 | 38.805 |
| 12.0 | 38.9 |
| 15.0 | 38.943 |
| 18.0 | 38.978 |
| 6.0 | 38.714 |
| 9.0 | 38.764 |
| 12.0 | 38.798 |
| 15.0 | 38.827 |
| 18.0 | 38.794 |
| 6.0 | 38.684 |
| 9.0 | 38.813 |
| 12.0 | 38.859 |
| 15.0 | 38.919 |
| 18.0 | 38.903 |
| 6.0 | 38.654 |
| 9.0 | 38.793 |
| 12.0 | 38.862 |
| 15.0 | 38.963 |
| 18.0 | 38.945 |
| 6.0 | 38.631 |
| 9.0 | 38.793 |
| 12.0 | 38.867 |
| 15.0 | 38.949 |
| 18.0 | 38.979 |
| 6.0 | 38.603 |
| 9.0 | 38.754 |
| 12.0 | 38.851 |
| 15.0 | 38.951 |
| 18.0 | 38.972 |
| 6.0 | 38.573 |
| 9.0 | 38.745 |
| 12.0 | 38.842 |
| 15.0 | 38.936 |
| 18.0 | 38.968 |
| 6.0 | 38.576 |
| 9.0 | 38.738 |
| 12.0 | 38.811 |
| 15.0 | 38.925 |
| 18.0 | 38.956 |
| 6.0 | 38.574 |
| 9.0 | 38.714 |
| 12.0 | 38.807 |
| 15.0 | 38.906 |
| 18.0 | 38.944 |
| 6.0 | 38.699 |
| 9.0 | 38.73 |
| 12.0 | 38.771 |
| 15.0 | 38.764 |
| 18.0 | 38.775 |
| 6.0 | 38.656 |
| 9.0 | 38.769 |
| 12.0 | 38.828 |
| 15.0 | 38.851 |
| 18.0 | 38.88 |
| 6.0 | 38.615 |
| 9.0 | 38.741 |
| 12.0 | 38.824 |
| 15.0 | 38.892 |
| 18.0 | 38.919 |
| 6.0 | 38.583 |
| 9.0 | 38.734 |
| 12.0 | 38.827 |
| 15.0 | 38.874 |
| 18.0 | 38.95 |
| 6.0 | 38.554 |
| 9.0 | 38.692 |
| 12.0 | 38.808 |
| 15.0 | 38.877 |
| 18.0 | 38.941 |
| 6.0 | 38.518 |
| 9.0 | 38.682 |
| 12.0 | 38.799 |
| 15.0 | 38.861 |
| 18.0 | 38.937 |
| 6.0 | 38.523 |
| 9.0 | 38.672 |
| 12.0 | 38.765 |
| 15.0 | 38.848 |
| 18.0 | 38.924 |
| 6.0 | 38.522 |
| 9.0 | 38.648 |
| 12.0 | 38.761 |
| 15.0 | 38.828 |
| 18.0 | 38.911 |
| 6.0 | 38.672 |
| 9.0 | 38.694 |
| 12.0 | 38.74 |
| 15.0 | 38.752 |
| 18.0 | 38.732 |
| 6.0 | 38.625 |
| 9.0 | 38.723 |
| 12.0 | 38.788 |
| 15.0 | 38.83 |
| 18.0 | 38.832 |
| 6.0 | 38.576 |
| 9.0 | 38.687 |
| 12.0 | 38.778 |
| 15.0 | 38.863 |
| 18.0 | 38.868 |
| 6.0 | 38.544 |
| 9.0 | 38.674 |
| 12.0 | 38.777 |
| 15.0 | 38.846 |
| 18.0 | 38.897 |
| 6.0 | 38.512 |
| 9.0 | 38.629 |
| 12.0 | 38.755 |
| 15.0 | 38.847 |
| 18.0 | 38.887 |
| 6.0 | 38.476 |
| 9.0 | 38.616 |
| 12.0 | 38.741 |
| 15.0 | 38.829 |
| 18.0 | 38.88 |
| 6.0 | 38.478 |
| 9.0 | 38.605 |
| 12.0 | 38.71 |
| 15.0 | 38.815 |
| 18.0 | 38.866 |
| 6.0 | 38.476 |
| 9.0 | 38.578 |
| 12.0 | 38.7 |
| 15.0 | 38.794 |
| 18.0 | 38.852 |
| 6.0 | 38.656 |
| 9.0 | 38.692 |
| 12.0 | 38.714 |
| 15.0 | 38.732 |
| 18.0 | 38.714 |
| 6.0 | 38.607 |
| 9.0 | 38.717 |
| 12.0 | 38.758 |
| 15.0 | 38.803 |
| 18.0 | 38.806 |
| 6.0 | 38.555 |
| 9.0 | 38.675 |
| 12.0 | 38.744 |
| 15.0 | 38.834 |
| 18.0 | 38.838 |
| 6.0 | 38.519 |
| 9.0 | 38.656 |
| 12.0 | 38.736 |
| 15.0 | 38.814 |
| 18.0 | 38.865 |
| 6.0 | 38.48 |
| 9.0 | 38.607 |
| 12.0 | 38.714 |
| 15.0 | 38.814 |
| 18.0 | 38.852 |
| 6.0 | 38.444 |
| 9.0 | 38.59 |
| 12.0 | 38.698 |
| 15.0 | 38.79 |
| 18.0 | 38.845 |
| 6.0 | 38.446 |
| 9.0 | 38.576 |
| 12.0 | 38.662 |
| 15.0 | 38.774 |
| 18.0 | 38.83 |
| 6.0 | 38.443 |
| 9.0 | 38.549 |
| 12.0 | 38.655 |
| 15.0 | 38.752 |
| 18.0 | 38.815 |
| 6.0 | 38.647 |
| 9.0 | 38.686 |
| 12.0 | 38.697 |
| 15.0 | 38.711 |
| 18.0 | 38.702 |
| 6.0 | 38.595 |
| 9.0 | 38.71 |
| 12.0 | 38.733 |
| 15.0 | 38.775 |
| 18.0 | 38.791 |
| 6.0 | 38.538 |
| 9.0 | 38.665 |
| 12.0 | 38.711 |
| 15.0 | 38.801 |
| 18.0 | 38.817 |
| 6.0 | 38.499 |
| 9.0 | 38.642 |
| 12.0 | 38.701 |
| 15.0 | 38.776 |
| 18.0 | 38.841 |
| 6.0 | 38.461 |
| 9.0 | 38.589 |
| 12.0 | 38.673 |
| 15.0 | 38.773 |
| 18.0 | 38.827 |
| 6.0 | 38.423 |
| 9.0 | 38.569 |
| 12.0 | 38.654 |
| 15.0 | 38.748 |
| 18.0 | 38.818 |
| 6.0 | 38.414 |
| 9.0 | 38.555 |
| 12.0 | 38.616 |
| 15.0 | 38.729 |
| 18.0 | 38.801 |
| 6.0 | 38.41 |
| 9.0 | 38.526 |
| 12.0 | 38.607 |
| 15.0 | 38.706 |
| 18.0 | 38.786 |
| 6.0 | 38.624 |
| 9.0 | 38.67 |
| 12.0 | 38.688 |
| 15.0 | 38.682 |
| 18.0 | 38.687 |
| 6.0 | 38.569 |
| 9.0 | 38.691 |
| 12.0 | 38.728 |
| 15.0 | 38.743 |
| 18.0 | 38.771 |
| 6.0 | 38.513 |
| 9.0 | 38.645 |
| 12.0 | 38.705 |
| 15.0 | 38.767 |
| 18.0 | 38.795 |
| 6.0 | 38.475 |
| 9.0 | 38.62 |
| 12.0 | 38.69 |
| 15.0 | 38.741 |
| 18.0 | 38.814 |
| 6.0 | 38.436 |
| 9.0 | 38.565 |
| 12.0 | 38.661 |
| 15.0 | 38.734 |
| 18.0 | 38.798 |
| 6.0 | 38.396 |
| 9.0 | 38.542 |
| 12.0 | 38.64 |
| 15.0 | 38.708 |
| 18.0 | 38.787 |
| 6.0 | 38.384 |
| 9.0 | 38.526 |
| 12.0 | 38.6 |
| 15.0 | 38.688 |
| 18.0 | 38.77 |
| 6.0 | 38.387 |
| 9.0 | 38.496 |
| 12.0 | 38.591 |
| 15.0 | 38.668 |
| 18.0 | 38.749 |
| 6.0 | 38.813 |
| 9.0 | 38.804 |
| 12.0 | 38.792 |
| 15.0 | 38.803 |
| 18.0 | 38.747 |
| 6.0 | 38.818 |
| 9.0 | 38.887 |
| 12.0 | 38.875 |
| 15.0 | 38.878 |
| 18.0 | 38.848 |
| 6.0 | 38.816 |
| 9.0 | 38.886 |
| 12.0 | 38.903 |
| 15.0 | 38.92 |
| 18.0 | 38.896 |
| 6.0 | 38.818 |
| 9.0 | 38.875 |
| 12.0 | 38.902 |
| 15.0 | 38.931 |
| 18.0 | 38.92 |
| 6.0 | 38.768 |
| 9.0 | 38.864 |
| 12.0 | 38.895 |
| 15.0 | 38.934 |
| 18.0 | 38.924 |
| 6.0 | 38.783 |
| 9.0 | 38.88 |
| 12.0 | 38.881 |
| 15.0 | 38.931 |
| 18.0 | 38.922 |
| 6.0 | 38.786 |
| 9.0 | 38.875 |
| 12.0 | 38.889 |
| 15.0 | 38.934 |
| 18.0 | 38.924 |
| 6.0 | 38.762 |
| 9.0 | 38.849 |
| 12.0 | 38.891 |
| 15.0 | 38.924 |
| 18.0 | 38.913 |
| 6.0 | 38.668 |
| 9.0 | 38.742 |
| 12.0 | 38.742 |
| 15.0 | 38.762 |
| 18.0 | 38.74 |
| 6.0 | 38.653 |
| 9.0 | 38.805 |
| 12.0 | 38.818 |
| 15.0 | 38.833 |
| 18.0 | 38.841 |
| 6.0 | 38.642 |
| 9.0 | 38.802 |
| 12.0 | 38.842 |
| 15.0 | 38.876 |
| 18.0 | 38.887 |
| 6.0 | 38.638 |
| 9.0 | 38.786 |
| 12.0 | 38.841 |
| 15.0 | 38.884 |
| 18.0 | 38.904 |
| 6.0 | 38.584 |
| 9.0 | 38.77 |
| 12.0 | 38.83 |
| 15.0 | 38.882 |
| 18.0 | 38.907 |
| 6.0 | 38.594 |
| 9.0 | 38.783 |
| 12.0 | 38.814 |
| 15.0 | 38.876 |
| 18.0 | 38.905 |
| 6.0 | 38.597 |
| 9.0 | 38.777 |
| 12.0 | 38.819 |
| 15.0 | 38.878 |
| 18.0 | 38.905 |
| 6.0 | 38.574 |
| 9.0 | 38.75 |
| 12.0 | 38.82 |
| 15.0 | 38.865 |
| 18.0 | 38.894 |
| 6.0 | 38.645 |
| 9.0 | 38.657 |
| 12.0 | 38.679 |
| 15.0 | 38.712 |
| 18.0 | 38.702 |
| 6.0 | 38.609 |
| 9.0 | 38.709 |
| 12.0 | 38.747 |
| 15.0 | 38.777 |
| 18.0 | 38.8 |
| 6.0 | 38.586 |
| 9.0 | 38.696 |
| 12.0 | 38.766 |
| 15.0 | 38.816 |
| 18.0 | 38.838 |
| 6.0 | 38.577 |
| 9.0 | 38.674 |
| 12.0 | 38.761 |
| 15.0 | 38.821 |
| 18.0 | 38.857 |
| 6.0 | 38.519 |
| 9.0 | 38.655 |
| 12.0 | 38.747 |
| 15.0 | 38.817 |
| 18.0 | 38.858 |
| 6.0 | 38.526 |
| 9.0 | 38.664 |
| 12.0 | 38.727 |
| 15.0 | 38.808 |
| 18.0 | 38.855 |
| 6.0 | 38.528 |
| 9.0 | 38.656 |
| 12.0 | 38.73 |
| 15.0 | 38.806 |
| 18.0 | 38.852 |
| 6.0 | 38.504 |
| 9.0 | 38.627 |
| 12.0 | 38.729 |
| 15.0 | 38.792 |
| 18.0 | 38.838 |
| 6.0 | 38.627 |
| 9.0 | 38.623 |
| 12.0 | 38.628 |
| 15.0 | 38.663 |
| 18.0 | 38.652 |
| 6.0 | 38.58 |
| 9.0 | 38.657 |
| 12.0 | 38.686 |
| 15.0 | 38.725 |
| 18.0 | 38.744 |
| 6.0 | 38.544 |
| 9.0 | 38.634 |
| 12.0 | 38.698 |
| 15.0 | 38.759 |
| 18.0 | 38.779 |
| 6.0 | 38.528 |
| 9.0 | 38.604 |
| 12.0 | 38.686 |
| 15.0 | 38.762 |
| 18.0 | 38.796 |
| 6.0 | 38.468 |
| 9.0 | 38.582 |
| 12.0 | 38.669 |
| 15.0 | 38.755 |
| 18.0 | 38.795 |
| 6.0 | 38.473 |
| 9.0 | 38.588 |
| 12.0 | 38.646 |
| 15.0 | 38.744 |
| 18.0 | 38.79 |
| 6.0 | 38.474 |
| 9.0 | 38.577 |
| 12.0 | 38.647 |
| 15.0 | 38.74 |
| 18.0 | 38.787 |
| 6.0 | 38.45 |
| 9.0 | 38.544 |
| 12.0 | 38.641 |
| 15.0 | 38.721 |
| 18.0 | 38.767 |
| 6.0 | 38.566 |
| 9.0 | 38.604 |
| 12.0 | 38.584 |
| 15.0 | 38.632 |
| 18.0 | 38.623 |
| 6.0 | 38.513 |
| 9.0 | 38.628 |
| 12.0 | 38.631 |
| 15.0 | 38.681 |
| 18.0 | 38.702 |
| 6.0 | 38.47 |
| 9.0 | 38.595 |
| 12.0 | 38.634 |
| 15.0 | 38.709 |
| 18.0 | 38.737 |
| 6.0 | 38.447 |
| 9.0 | 38.56 |
| 12.0 | 38.617 |
| 15.0 | 38.709 |
| 18.0 | 38.752 |
| 6.0 | 38.416 |
| 9.0 | 38.543 |
| 12.0 | 38.597 |
| 15.0 | 38.7 |
| 18.0 | 38.75 |
| 6.0 | 38.417 |
| 9.0 | 38.546 |
| 12.0 | 38.572 |
| 15.0 | 38.687 |
| 18.0 | 38.743 |
| 6.0 | 38.421 |
| 9.0 | 38.534 |
| 12.0 | 38.572 |
| 15.0 | 38.681 |
| 18.0 | 38.738 |
| 6.0 | 38.397 |
| 9.0 | 38.5 |
| 12.0 | 38.565 |
| 15.0 | 38.66 |
| 18.0 | 38.718 |
| 6.0 | 38.585 |
| 9.0 | 38.604 |
| 12.0 | 38.584 |
| 15.0 | 38.599 |
| 18.0 | 38.599 |
| 6.0 | 38.529 |
| 9.0 | 38.626 |
| 12.0 | 38.623 |
| 15.0 | 38.641 |
| 18.0 | 38.674 |
| 6.0 | 38.482 |
| 9.0 | 38.587 |
| 12.0 | 38.619 |
| 15.0 | 38.66 |
| 18.0 | 38.703 |
| 6.0 | 38.456 |
| 9.0 | 38.545 |
| 12.0 | 38.596 |
| 15.0 | 38.655 |
| 18.0 | 38.714 |
| 6.0 | 38.42 |
| 9.0 | 38.524 |
| 12.0 | 38.575 |
| 15.0 | 38.644 |
| 18.0 | 38.709 |
| 6.0 | 38.39 |
| 9.0 | 38.516 |
| 12.0 | 38.552 |
| 15.0 | 38.626 |
| 18.0 | 38.695 |
| 6.0 | 38.391 |
| 9.0 | 38.502 |
| 12.0 | 38.55 |
| 15.0 | 38.618 |
| 18.0 | 38.69 |
| 6.0 | 38.366 |
| 9.0 | 38.467 |
| 12.0 | 38.542 |
| 15.0 | 38.596 |
| 18.0 | 38.669 |
| 6.0 | 38.589 |
| 9.0 | 38.591 |
| 12.0 | 38.578 |
| 15.0 | 38.594 |
| 18.0 | 38.575 |
| 6.0 | 38.533 |
| 9.0 | 38.609 |
| 12.0 | 38.615 |
| 15.0 | 38.63 |
| 18.0 | 38.644 |
| 6.0 | 38.485 |
| 9.0 | 38.569 |
| 12.0 | 38.606 |
| 15.0 | 38.644 |
| 18.0 | 38.667 |
| 6.0 | 38.457 |
| 9.0 | 38.522 |
| 12.0 | 38.578 |
| 15.0 | 38.633 |
| 18.0 | 38.675 |
| 6.0 | 38.422 |
| 9.0 | 38.497 |
| 12.0 | 38.554 |
| 15.0 | 38.618 |
| 18.0 | 38.668 |
| 6.0 | 38.389 |
| 9.0 | 38.486 |
| 12.0 | 38.528 |
| 15.0 | 38.598 |
| 18.0 | 38.652 |
| 6.0 | 38.388 |
| 9.0 | 38.471 |
| 12.0 | 38.525 |
| 15.0 | 38.589 |
| 18.0 | 38.647 |
| 6.0 | 38.363 |
| 9.0 | 38.435 |
| 12.0 | 38.515 |
| 15.0 | 38.566 |
| 18.0 | 38.625 |
| 6.0 | 38.564 |
| 9.0 | 38.561 |
| 12.0 | 38.572 |
| 15.0 | 38.594 |
| 18.0 | 38.547 |
| 6.0 | 38.508 |
| 9.0 | 38.576 |
| 12.0 | 38.606 |
| 15.0 | 38.628 |
| 18.0 | 38.611 |
| 6.0 | 38.462 |
| 9.0 | 38.532 |
| 12.0 | 38.596 |
| 15.0 | 38.637 |
| 18.0 | 38.63 |
| 6.0 | 38.432 |
| 9.0 | 38.481 |
| 12.0 | 38.561 |
| 15.0 | 38.62 |
| 18.0 | 38.63 |
| 6.0 | 38.397 |
| 9.0 | 38.453 |
| 12.0 | 38.534 |
| 15.0 | 38.6 |
| 18.0 | 38.618 |
| 6.0 | 38.362 |
| 9.0 | 38.44 |
| 12.0 | 38.504 |
| 15.0 | 38.578 |
| 18.0 | 38.601 |
| 6.0 | 38.36 |
| 9.0 | 38.423 |
| 12.0 | 38.499 |
| 15.0 | 38.568 |
| 18.0 | 38.594 |
| 6.0 | 38.364 |
| 9.0 | 38.394 |
| 12.0 | 38.488 |
| 15.0 | 38.539 |
| 18.0 | 38.571 |
| 6.0 | 38.701 |
| 9.0 | 38.731 |
| 12.0 | 38.783 |
| 15.0 | 38.739 |
| 18.0 | 38.708 |
| 6.0 | 38.73 |
| 9.0 | 38.808 |
| 12.0 | 38.859 |
| 15.0 | 38.834 |
| 18.0 | 38.819 |
| 6.0 | 38.744 |
| 9.0 | 38.825 |
| 12.0 | 38.873 |
| 15.0 | 38.887 |
| 18.0 | 38.852 |
| 6.0 | 38.74 |
| 9.0 | 38.828 |
| 12.0 | 38.907 |
| 15.0 | 38.882 |
| 18.0 | 38.893 |
| 6.0 | 38.738 |
| 9.0 | 38.83 |
| 12.0 | 38.897 |
| 15.0 | 38.905 |
| 18.0 | 38.896 |
| 6.0 | 38.711 |
| 9.0 | 38.833 |
| 12.0 | 38.898 |
| 15.0 | 38.912 |
| 18.0 | 38.906 |
| 6.0 | 38.705 |
| 9.0 | 38.833 |
| 12.0 | 38.892 |
| 15.0 | 38.898 |
| 18.0 | 38.911 |
| 6.0 | 38.728 |
| 9.0 | 38.823 |
| 12.0 | 38.897 |
| 15.0 | 38.901 |
| 18.0 | 38.904 |
| 6.0 | 38.567 |
| 9.0 | 38.634 |
| 12.0 | 38.699 |
| 15.0 | 38.693 |
| 18.0 | 38.691 |
| 6.0 | 38.576 |
| 9.0 | 38.708 |
| 12.0 | 38.768 |
| 15.0 | 38.786 |
| 18.0 | 38.796 |
| 6.0 | 38.579 |
| 9.0 | 38.718 |
| 12.0 | 38.776 |
| 15.0 | 38.829 |
| 18.0 | 38.825 |
| 6.0 | 38.569 |
| 9.0 | 38.714 |
| 12.0 | 38.805 |
| 15.0 | 38.825 |
| 18.0 | 38.864 |
| 6.0 | 38.564 |
| 9.0 | 38.712 |
| 12.0 | 38.791 |
| 15.0 | 38.843 |
| 18.0 | 38.863 |
| 6.0 | 38.532 |
| 9.0 | 38.712 |
| 12.0 | 38.789 |
| 15.0 | 38.845 |
| 18.0 | 38.871 |
| 6.0 | 38.525 |
| 9.0 | 38.711 |
| 12.0 | 38.779 |
| 15.0 | 38.829 |
| 18.0 | 38.873 |
| 6.0 | 38.549 |
| 9.0 | 38.698 |
| 12.0 | 38.783 |
| 15.0 | 38.83 |
| 18.0 | 38.865 |
| 6.0 | 38.536 |
| 9.0 | 38.54 |
| 12.0 | 38.615 |
| 15.0 | 38.626 |
| 18.0 | 38.626 |
| 6.0 | 38.52 |
| 9.0 | 38.594 |
| 12.0 | 38.679 |
| 15.0 | 38.712 |
| 18.0 | 38.723 |
| 6.0 | 38.51 |
| 9.0 | 38.594 |
| 12.0 | 38.68 |
| 15.0 | 38.752 |
| 18.0 | 38.757 |
| 6.0 | 38.491 |
| 9.0 | 38.582 |
| 12.0 | 38.703 |
| 15.0 | 38.745 |
| 18.0 | 38.793 |
| 6.0 | 38.483 |
| 9.0 | 38.576 |
| 12.0 | 38.685 |
| 15.0 | 38.759 |
| 18.0 | 38.789 |
| 6.0 | 38.449 |
| 9.0 | 38.572 |
| 12.0 | 38.678 |
| 15.0 | 38.759 |
| 18.0 | 38.794 |
| 6.0 | 38.441 |
| 9.0 | 38.568 |
| 12.0 | 38.666 |
| 15.0 | 38.739 |
| 18.0 | 38.795 |
| 6.0 | 38.464 |
| 9.0 | 38.553 |
| 12.0 | 38.668 |
| 15.0 | 38.739 |
| 18.0 | 38.785 |
| 6.0 | 38.496 |
| 9.0 | 38.537 |
| 12.0 | 38.564 |
| 15.0 | 38.562 |
| 18.0 | 38.574 |
| 6.0 | 38.467 |
| 9.0 | 38.57 |
| 12.0 | 38.61 |
| 15.0 | 38.636 |
| 18.0 | 38.667 |
| 6.0 | 38.44 |
| 9.0 | 38.559 |
| 12.0 | 38.604 |
| 15.0 | 38.676 |
| 18.0 | 38.698 |
| 6.0 | 38.415 |
| 9.0 | 38.539 |
| 12.0 | 38.619 |
| 15.0 | 38.664 |
| 18.0 | 38.732 |
| 6.0 | 38.403 |
| 9.0 | 38.53 |
| 12.0 | 38.598 |
| 15.0 | 38.676 |
| 18.0 | 38.725 |
| 6.0 | 38.369 |
| 9.0 | 38.523 |
| 12.0 | 38.587 |
| 15.0 | 38.673 |
| 18.0 | 38.729 |
| 6.0 | 38.359 |
| 9.0 | 38.517 |
| 12.0 | 38.574 |
| 15.0 | 38.65 |
| 18.0 | 38.728 |
| 6.0 | 38.38 |
| 9.0 | 38.498 |
| 12.0 | 38.573 |
| 15.0 | 38.648 |
| 18.0 | 38.716 |
| 6.0 | 38.5 |
| 9.0 | 38.513 |
| 12.0 | 38.545 |
| 15.0 | 38.526 |
| 18.0 | 38.534 |
| 6.0 | 38.467 |
| 9.0 | 38.536 |
| 12.0 | 38.578 |
| 15.0 | 38.587 |
| 18.0 | 38.615 |
| 6.0 | 38.433 |
| 9.0 | 38.514 |
| 12.0 | 38.56 |
| 15.0 | 38.619 |
| 18.0 | 38.641 |
| 6.0 | 38.401 |
| 9.0 | 38.488 |
| 12.0 | 38.571 |
| 15.0 | 38.603 |
| 18.0 | 38.671 |
| 6.0 | 38.374 |
| 9.0 | 38.474 |
| 12.0 | 38.547 |
| 15.0 | 38.613 |
| 18.0 | 38.662 |
| 6.0 | 38.336 |
| 9.0 | 38.464 |
| 12.0 | 38.535 |
| 15.0 | 38.608 |
| 18.0 | 38.663 |
| 6.0 | 38.325 |
| 9.0 | 38.456 |
| 12.0 | 38.52 |
| 15.0 | 38.583 |
| 18.0 | 38.661 |
| 6.0 | 38.345 |
| 9.0 | 38.435 |
| 12.0 | 38.515 |
| 15.0 | 38.576 |
| 18.0 | 38.648 |
| 6.0 | 38.493 |
| 9.0 | 38.491 |
| 12.0 | 38.539 |
| 15.0 | 38.506 |
| 18.0 | 38.502 |
| 6.0 | 38.457 |
| 9.0 | 38.509 |
| 12.0 | 38.565 |
| 15.0 | 38.556 |
| 18.0 | 38.575 |
| 6.0 | 38.419 |
| 9.0 | 38.481 |
| 12.0 | 38.54 |
| 15.0 | 38.578 |
| 18.0 | 38.591 |
| 6.0 | 38.385 |
| 9.0 | 38.446 |
| 12.0 | 38.544 |
| 15.0 | 38.556 |
| 18.0 | 38.618 |
| 6.0 | 38.354 |
| 9.0 | 38.428 |
| 12.0 | 38.515 |
| 15.0 | 38.564 |
| 18.0 | 38.606 |
| 6.0 | 38.325 |
| 9.0 | 38.414 |
| 12.0 | 38.501 |
| 15.0 | 38.554 |
| 18.0 | 38.601 |
| 6.0 | 38.314 |
| 9.0 | 38.404 |
| 12.0 | 38.483 |
| 15.0 | 38.527 |
| 18.0 | 38.597 |
| 6.0 | 38.335 |
| 9.0 | 38.382 |
| 12.0 | 38.477 |
| 15.0 | 38.518 |
| 18.0 | 38.579 |
| 6.0 | 38.489 |
| 9.0 | 38.473 |
| 12.0 | 38.516 |
| 15.0 | 38.501 |
| 18.0 | 38.474 |
| 6.0 | 38.452 |
| 9.0 | 38.488 |
| 12.0 | 38.539 |
| 15.0 | 38.546 |
| 18.0 | 38.537 |
| 6.0 | 38.416 |
| 9.0 | 38.455 |
| 12.0 | 38.509 |
| 15.0 | 38.562 |
| 18.0 | 38.549 |
| 6.0 | 38.381 |
| 9.0 | 38.416 |
| 12.0 | 38.508 |
| 15.0 | 38.534 |
| 18.0 | 38.569 |
| 6.0 | 38.348 |
| 9.0 | 38.393 |
| 12.0 | 38.476 |
| 15.0 | 38.538 |
| 18.0 | 38.554 |
| 6.0 | 38.318 |
| 9.0 | 38.376 |
| 12.0 | 38.457 |
| 15.0 | 38.525 |
| 18.0 | 38.547 |
| 6.0 | 38.302 |
| 9.0 | 38.365 |
| 12.0 | 38.441 |
| 15.0 | 38.495 |
| 18.0 | 38.544 |
| 6.0 | 38.323 |
| 9.0 | 38.342 |
| 12.0 | 38.433 |
| 15.0 | 38.485 |
| 18.0 | 38.524 |
| 6.0 | 38.509 |
| 9.0 | 38.476 |
| 12.0 | 38.506 |
| 15.0 | 38.493 |
| 18.0 | 38.471 |
| 6.0 | 38.473 |
| 9.0 | 38.49 |
| 12.0 | 38.524 |
| 15.0 | 38.537 |
| 18.0 | 38.532 |
| 6.0 | 38.434 |
| 9.0 | 38.456 |
| 12.0 | 38.492 |
| 15.0 | 38.55 |
| 18.0 | 38.537 |
| 6.0 | 38.397 |
| 9.0 | 38.413 |
| 12.0 | 38.487 |
| 15.0 | 38.518 |
| 18.0 | 38.553 |
| 6.0 | 38.362 |
| 9.0 | 38.387 |
| 12.0 | 38.446 |
| 15.0 | 38.514 |
| 18.0 | 38.533 |
| 6.0 | 38.332 |
| 9.0 | 38.367 |
| 12.0 | 38.424 |
| 15.0 | 38.498 |
| 18.0 | 38.522 |
| 6.0 | 38.315 |
| 9.0 | 38.355 |
| 12.0 | 38.404 |
| 15.0 | 38.468 |
| 18.0 | 38.517 |
| 6.0 | 38.32 |
| 9.0 | 38.33 |
| 12.0 | 38.397 |
| 15.0 | 38.456 |
| 18.0 | 38.495 |